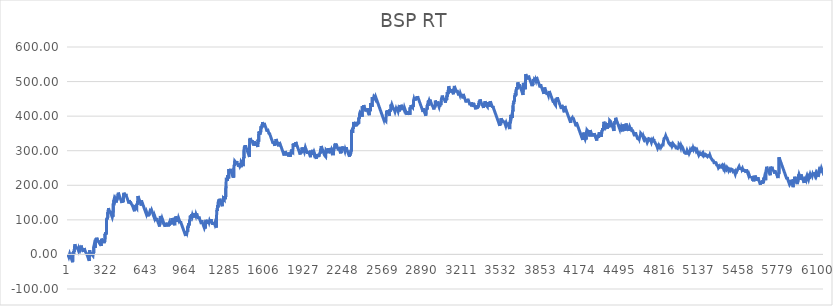
| Category | BSP RT |
|---|---|
| 0 | -1 |
| 1 | -2 |
| 2 | -3 |
| 3 | -4 |
| 4 | -5 |
| 5 | -6 |
| 6 | -7 |
| 7 | -8 |
| 8 | -4.51 |
| 9 | -5.51 |
| 10 | -6.51 |
| 11 | -7.51 |
| 12 | -8.51 |
| 13 | 1.933 |
| 14 | 0.877 |
| 15 | -0.18 |
| 16 | -1.18 |
| 17 | -2.18 |
| 18 | -3.18 |
| 19 | -4.18 |
| 20 | -5.18 |
| 21 | -6.18 |
| 22 | -7.18 |
| 23 | -8.18 |
| 24 | -9.18 |
| 25 | -10.18 |
| 26 | -11.18 |
| 27 | -12.18 |
| 28 | -13.18 |
| 29 | -14.18 |
| 30 | -15.18 |
| 31 | -16.18 |
| 32 | -17.18 |
| 33 | -18.18 |
| 34 | -19.18 |
| 35 | -20.18 |
| 36 | -21.288 |
| 37 | -22.396 |
| 38 | -23.504 |
| 39 | -24.612 |
| 40 | 6.1 |
| 41 | 5.1 |
| 42 | 4.1 |
| 43 | 3.1 |
| 44 | 2.1 |
| 45 | 1.1 |
| 46 | 0.065 |
| 47 | 10.03 |
| 48 | 8.995 |
| 49 | 7.96 |
| 50 | 6.907 |
| 51 | 5.855 |
| 52 | 19.502 |
| 53 | 18.45 |
| 54 | 17.418 |
| 55 | 29.386 |
| 56 | 28.354 |
| 57 | 27.322 |
| 58 | 26.29 |
| 59 | 25.29 |
| 60 | 24.29 |
| 61 | 23.29 |
| 62 | 22.29 |
| 63 | 21.29 |
| 64 | 20.29 |
| 65 | 19.29 |
| 66 | 18.29 |
| 67 | 17.29 |
| 68 | 16.29 |
| 69 | 21.667 |
| 70 | 20.643 |
| 71 | 19.62 |
| 72 | 18.62 |
| 73 | 17.62 |
| 74 | 16.62 |
| 75 | 20.795 |
| 76 | 19.79 |
| 77 | 18.785 |
| 78 | 17.78 |
| 79 | 16.78 |
| 80 | 15.78 |
| 81 | 14.78 |
| 82 | 13.78 |
| 83 | 12.78 |
| 84 | 11.78 |
| 85 | 10.78 |
| 86 | 9.78 |
| 87 | 16.8 |
| 88 | 15.78 |
| 89 | 14.76 |
| 90 | 13.74 |
| 91 | 18.422 |
| 92 | 17.415 |
| 93 | 16.408 |
| 94 | 15.4 |
| 95 | 14.4 |
| 96 | 13.4 |
| 97 | 12.4 |
| 98 | 11.4 |
| 99 | 10.4 |
| 100 | 15.58 |
| 101 | 14.57 |
| 102 | 13.56 |
| 103 | 12.55 |
| 104 | 11.506 |
| 105 | 10.462 |
| 106 | 25.178 |
| 107 | 24.134 |
| 108 | 23.09 |
| 109 | 22.09 |
| 110 | 21.09 |
| 111 | 20.09 |
| 112 | 19.09 |
| 113 | 18.09 |
| 114 | 17.09 |
| 115 | 16.09 |
| 116 | 15.09 |
| 117 | 14.09 |
| 118 | 13.09 |
| 119 | 12.09 |
| 120 | 11.09 |
| 121 | 10.09 |
| 122 | 9.09 |
| 123 | 8.09 |
| 124 | 7.09 |
| 125 | 13.68 |
| 126 | 12.67 |
| 127 | 11.66 |
| 128 | 10.65 |
| 129 | 9.64 |
| 130 | 8.618 |
| 131 | 18.096 |
| 132 | 17.074 |
| 133 | 16.052 |
| 134 | 15.03 |
| 135 | 14.03 |
| 136 | 13.03 |
| 137 | 12.03 |
| 138 | 11.03 |
| 139 | 10.03 |
| 140 | 9.03 |
| 141 | 8.03 |
| 142 | 7.03 |
| 143 | 6.03 |
| 144 | 5.03 |
| 145 | 8.42 |
| 146 | 7.41 |
| 147 | 6.4 |
| 148 | 5.4 |
| 149 | 4.4 |
| 150 | 3.4 |
| 151 | 2.4 |
| 152 | 1.4 |
| 153 | 0.4 |
| 154 | -0.6 |
| 155 | -1.6 |
| 156 | -2.6 |
| 157 | -3.6 |
| 158 | -4.6 |
| 159 | -5.6 |
| 160 | -6.6 |
| 161 | -7.6 |
| 162 | -8.6 |
| 163 | -9.6 |
| 164 | -10.6 |
| 165 | -11.6 |
| 166 | -12.6 |
| 167 | -13.6 |
| 168 | -14.6 |
| 169 | -15.6 |
| 170 | -16.6 |
| 171 | -17.6 |
| 172 | -18.75 |
| 173 | -19.9 |
| 174 | -21.05 |
| 175 | 11.8 |
| 176 | 10.8 |
| 177 | 9.8 |
| 178 | 8.8 |
| 179 | 7.8 |
| 180 | 6.8 |
| 181 | 5.8 |
| 182 | 4.8 |
| 183 | 3.8 |
| 184 | 2.8 |
| 185 | 1.8 |
| 186 | 0.8 |
| 187 | -0.2 |
| 188 | 5.314 |
| 189 | 4.308 |
| 190 | 3.302 |
| 191 | 2.296 |
| 192 | 1.29 |
| 193 | 0.29 |
| 194 | -0.71 |
| 195 | -1.71 |
| 196 | -2.71 |
| 197 | 0.89 |
| 198 | -0.11 |
| 199 | -1.11 |
| 200 | -2.11 |
| 201 | -3.11 |
| 202 | -4.11 |
| 203 | -5.11 |
| 204 | 2.483 |
| 205 | 1.447 |
| 206 | 0.41 |
| 207 | -0.71 |
| 208 | -1.83 |
| 209 | -2.95 |
| 210 | 24.17 |
| 211 | 23.162 |
| 212 | 27.655 |
| 213 | 26.648 |
| 214 | 25.64 |
| 215 | 24.64 |
| 216 | 23.64 |
| 217 | 22.64 |
| 218 | 21.64 |
| 219 | 20.64 |
| 220 | 19.64 |
| 221 | 18.555 |
| 222 | 27.73 |
| 223 | 26.682 |
| 224 | 42.784 |
| 225 | 41.736 |
| 226 | 40.688 |
| 227 | 39.64 |
| 228 | 46.584 |
| 229 | 45.568 |
| 230 | 44.552 |
| 231 | 43.536 |
| 232 | 42.524 |
| 233 | 48.111 |
| 234 | 47.098 |
| 235 | 46.086 |
| 236 | 45.086 |
| 237 | 44.086 |
| 238 | 43.086 |
| 239 | 42.086 |
| 240 | 41.086 |
| 241 | 40.086 |
| 242 | 39.086 |
| 243 | 38.086 |
| 244 | 40.821 |
| 245 | 39.806 |
| 246 | 38.806 |
| 247 | 37.806 |
| 248 | 36.806 |
| 249 | 35.806 |
| 250 | 39.816 |
| 251 | 38.816 |
| 252 | 37.816 |
| 253 | 36.816 |
| 254 | 35.816 |
| 255 | 34.816 |
| 256 | 33.816 |
| 257 | 32.816 |
| 258 | 31.816 |
| 259 | 30.816 |
| 260 | 29.816 |
| 261 | 33.643 |
| 262 | 32.629 |
| 263 | 31.616 |
| 264 | 30.616 |
| 265 | 29.616 |
| 266 | 28.616 |
| 267 | 27.616 |
| 268 | 26.616 |
| 269 | 25.526 |
| 270 | 24.436 |
| 271 | 45.356 |
| 272 | 44.266 |
| 273 | 43.266 |
| 274 | 42.266 |
| 275 | 41.266 |
| 276 | 40.266 |
| 277 | 39.266 |
| 278 | 38.266 |
| 279 | 37.266 |
| 280 | 36.266 |
| 281 | 35.266 |
| 282 | 34.266 |
| 283 | 33.248 |
| 284 | 41.63 |
| 285 | 40.612 |
| 286 | 39.594 |
| 287 | 38.576 |
| 288 | 37.576 |
| 289 | 36.576 |
| 290 | 35.576 |
| 291 | 34.576 |
| 292 | 33.576 |
| 293 | 32.558 |
| 294 | 31.54 |
| 295 | 39.922 |
| 296 | 38.904 |
| 297 | 37.886 |
| 298 | 36.802 |
| 299 | 35.718 |
| 300 | 34.634 |
| 301 | 59.55 |
| 302 | 58.466 |
| 303 | 57.466 |
| 304 | 56.466 |
| 305 | 64.002 |
| 306 | 62.988 |
| 307 | 61.974 |
| 308 | 60.96 |
| 309 | 59.946 |
| 310 | 58.686 |
| 311 | 57.426 |
| 312 | 98.166 |
| 313 | 103.56 |
| 314 | 102.554 |
| 315 | 101.548 |
| 316 | 100.542 |
| 317 | 99.536 |
| 318 | 106.296 |
| 319 | 105.276 |
| 320 | 104.256 |
| 321 | 103.236 |
| 322 | 102.116 |
| 323 | 121.946 |
| 324 | 120.826 |
| 325 | 119.761 |
| 326 | 118.696 |
| 327 | 117.631 |
| 328 | 133.566 |
| 329 | 132.566 |
| 330 | 131.566 |
| 331 | 130.566 |
| 332 | 129.566 |
| 333 | 128.566 |
| 334 | 127.566 |
| 335 | 126.566 |
| 336 | 125.566 |
| 337 | 124.566 |
| 338 | 123.566 |
| 339 | 122.566 |
| 340 | 121.566 |
| 341 | 125.453 |
| 342 | 124.439 |
| 343 | 123.426 |
| 344 | 122.426 |
| 345 | 121.426 |
| 346 | 120.426 |
| 347 | 119.426 |
| 348 | 118.426 |
| 349 | 117.426 |
| 350 | 116.426 |
| 351 | 115.426 |
| 352 | 114.426 |
| 353 | 113.426 |
| 354 | 112.426 |
| 355 | 111.426 |
| 356 | 110.426 |
| 357 | 109.426 |
| 358 | 108.426 |
| 359 | 107.426 |
| 360 | 106.426 |
| 361 | 105.426 |
| 362 | 112.193 |
| 363 | 111.159 |
| 364 | 110.126 |
| 365 | 108.936 |
| 366 | 107.746 |
| 367 | 106.556 |
| 368 | 147.366 |
| 369 | 146.332 |
| 370 | 145.298 |
| 371 | 144.264 |
| 372 | 156.67 |
| 373 | 155.636 |
| 374 | 154.626 |
| 375 | 161.146 |
| 376 | 160.136 |
| 377 | 159.126 |
| 378 | 158.116 |
| 379 | 157.116 |
| 380 | 156.116 |
| 381 | 155.116 |
| 382 | 154.116 |
| 383 | 153.106 |
| 384 | 159.496 |
| 385 | 158.486 |
| 386 | 157.476 |
| 387 | 156.466 |
| 388 | 155.466 |
| 389 | 154.466 |
| 390 | 153.466 |
| 391 | 152.466 |
| 392 | 151.466 |
| 393 | 150.386 |
| 394 | 159.306 |
| 395 | 158.306 |
| 396 | 157.306 |
| 397 | 156.306 |
| 398 | 155.306 |
| 399 | 154.278 |
| 400 | 165.25 |
| 401 | 164.222 |
| 402 | 163.194 |
| 403 | 162.166 |
| 404 | 161.108 |
| 405 | 160.051 |
| 406 | 174.624 |
| 407 | 173.566 |
| 408 | 178.656 |
| 409 | 177.636 |
| 410 | 176.616 |
| 411 | 175.616 |
| 412 | 174.616 |
| 413 | 173.616 |
| 414 | 172.616 |
| 415 | 171.616 |
| 416 | 170.616 |
| 417 | 169.616 |
| 418 | 168.616 |
| 419 | 167.616 |
| 420 | 166.616 |
| 421 | 165.616 |
| 422 | 164.616 |
| 423 | 163.616 |
| 424 | 162.616 |
| 425 | 161.616 |
| 426 | 160.616 |
| 427 | 159.616 |
| 428 | 158.616 |
| 429 | 157.616 |
| 430 | 156.616 |
| 431 | 155.616 |
| 432 | 154.616 |
| 433 | 153.616 |
| 434 | 152.616 |
| 435 | 151.616 |
| 436 | 150.616 |
| 437 | 149.616 |
| 438 | 148.616 |
| 439 | 160.594 |
| 440 | 159.562 |
| 441 | 158.53 |
| 442 | 157.498 |
| 443 | 156.466 |
| 444 | 155.466 |
| 445 | 154.466 |
| 446 | 153.466 |
| 447 | 152.378 |
| 448 | 151.29 |
| 449 | 150.202 |
| 450 | 149.114 |
| 451 | 175.026 |
| 452 | 174.026 |
| 453 | 173.026 |
| 454 | 172.026 |
| 455 | 178.211 |
| 456 | 177.196 |
| 457 | 176.181 |
| 458 | 175.166 |
| 459 | 174.166 |
| 460 | 173.166 |
| 461 | 172.166 |
| 462 | 171.166 |
| 463 | 170.166 |
| 464 | 169.166 |
| 465 | 168.166 |
| 466 | 167.166 |
| 467 | 166.091 |
| 468 | 174.616 |
| 469 | 173.616 |
| 470 | 172.616 |
| 471 | 171.616 |
| 472 | 170.616 |
| 473 | 169.616 |
| 474 | 168.616 |
| 475 | 167.616 |
| 476 | 166.616 |
| 477 | 165.616 |
| 478 | 164.616 |
| 479 | 163.616 |
| 480 | 162.616 |
| 481 | 161.616 |
| 482 | 160.616 |
| 483 | 159.616 |
| 484 | 158.616 |
| 485 | 157.616 |
| 486 | 156.616 |
| 487 | 155.616 |
| 488 | 154.616 |
| 489 | 153.616 |
| 490 | 152.616 |
| 491 | 151.616 |
| 492 | 150.616 |
| 493 | 149.616 |
| 494 | 148.616 |
| 495 | 147.616 |
| 496 | 146.592 |
| 497 | 156.568 |
| 498 | 155.544 |
| 499 | 154.52 |
| 500 | 153.496 |
| 501 | 152.496 |
| 502 | 151.496 |
| 503 | 150.496 |
| 504 | 149.496 |
| 505 | 148.496 |
| 506 | 147.496 |
| 507 | 152.286 |
| 508 | 151.276 |
| 509 | 150.266 |
| 510 | 149.256 |
| 511 | 148.256 |
| 512 | 147.256 |
| 513 | 146.256 |
| 514 | 145.254 |
| 515 | 148.941 |
| 516 | 147.938 |
| 517 | 146.936 |
| 518 | 145.936 |
| 519 | 144.936 |
| 520 | 143.936 |
| 521 | 142.936 |
| 522 | 141.936 |
| 523 | 140.936 |
| 524 | 139.936 |
| 525 | 138.936 |
| 526 | 137.936 |
| 527 | 136.936 |
| 528 | 135.936 |
| 529 | 134.936 |
| 530 | 133.936 |
| 531 | 132.936 |
| 532 | 131.936 |
| 533 | 130.936 |
| 534 | 129.936 |
| 535 | 128.936 |
| 536 | 127.936 |
| 537 | 126.936 |
| 538 | 125.936 |
| 539 | 124.904 |
| 540 | 123.871 |
| 541 | 133.338 |
| 542 | 132.306 |
| 543 | 131.239 |
| 544 | 143.173 |
| 545 | 142.106 |
| 546 | 141.106 |
| 547 | 140.106 |
| 548 | 139.106 |
| 549 | 138.106 |
| 550 | 137.106 |
| 551 | 136.106 |
| 552 | 139.406 |
| 553 | 138.406 |
| 554 | 137.406 |
| 555 | 136.406 |
| 556 | 135.406 |
| 557 | 134.368 |
| 558 | 133.33 |
| 559 | 146.592 |
| 560 | 145.554 |
| 561 | 144.516 |
| 562 | 143.484 |
| 563 | 142.452 |
| 564 | 154.27 |
| 565 | 153.238 |
| 566 | 152.206 |
| 567 | 151.15 |
| 568 | 168.854 |
| 569 | 167.798 |
| 570 | 166.742 |
| 571 | 165.686 |
| 572 | 164.686 |
| 573 | 163.686 |
| 574 | 162.686 |
| 575 | 161.686 |
| 576 | 160.686 |
| 577 | 159.686 |
| 578 | 158.686 |
| 579 | 157.686 |
| 580 | 156.686 |
| 581 | 155.686 |
| 582 | 154.686 |
| 583 | 153.686 |
| 584 | 152.686 |
| 585 | 151.686 |
| 586 | 150.686 |
| 587 | 149.686 |
| 588 | 148.686 |
| 589 | 147.686 |
| 590 | 146.686 |
| 591 | 145.686 |
| 592 | 144.686 |
| 593 | 143.686 |
| 594 | 142.628 |
| 595 | 141.571 |
| 596 | 156.114 |
| 597 | 155.056 |
| 598 | 154.056 |
| 599 | 153.056 |
| 600 | 152.056 |
| 601 | 151.056 |
| 602 | 150.056 |
| 603 | 149.056 |
| 604 | 148.056 |
| 605 | 147.056 |
| 606 | 146.056 |
| 607 | 145.056 |
| 608 | 144.056 |
| 609 | 143.056 |
| 610 | 142.056 |
| 611 | 141.056 |
| 612 | 140.056 |
| 613 | 139.056 |
| 614 | 138.056 |
| 615 | 137.056 |
| 616 | 136.056 |
| 617 | 135.056 |
| 618 | 134.056 |
| 619 | 133.056 |
| 620 | 132.056 |
| 621 | 131.056 |
| 622 | 130.056 |
| 623 | 129.056 |
| 624 | 128.056 |
| 625 | 127.056 |
| 626 | 126.056 |
| 627 | 125.056 |
| 628 | 124.056 |
| 629 | 123.056 |
| 630 | 122.056 |
| 631 | 121.056 |
| 632 | 120.056 |
| 633 | 119.056 |
| 634 | 118.056 |
| 635 | 117.056 |
| 636 | 116.056 |
| 637 | 115.036 |
| 638 | 122.216 |
| 639 | 121.196 |
| 640 | 120.176 |
| 641 | 119.176 |
| 642 | 118.176 |
| 643 | 117.176 |
| 644 | 116.176 |
| 645 | 115.176 |
| 646 | 114.176 |
| 647 | 113.176 |
| 648 | 112.176 |
| 649 | 111.176 |
| 650 | 110.141 |
| 651 | 109.106 |
| 652 | 119.091 |
| 653 | 118.056 |
| 654 | 117.056 |
| 655 | 116.056 |
| 656 | 115.056 |
| 657 | 114.056 |
| 658 | 113.056 |
| 659 | 112.036 |
| 660 | 111.016 |
| 661 | 119.996 |
| 662 | 118.976 |
| 663 | 117.956 |
| 664 | 120.716 |
| 665 | 119.696 |
| 666 | 118.668 |
| 667 | 126.911 |
| 668 | 125.884 |
| 669 | 124.856 |
| 670 | 129.726 |
| 671 | 128.716 |
| 672 | 127.706 |
| 673 | 126.696 |
| 674 | 125.696 |
| 675 | 124.696 |
| 676 | 123.696 |
| 677 | 122.696 |
| 678 | 121.696 |
| 679 | 127.284 |
| 680 | 126.271 |
| 681 | 125.258 |
| 682 | 124.246 |
| 683 | 123.246 |
| 684 | 122.246 |
| 685 | 121.246 |
| 686 | 120.246 |
| 687 | 119.246 |
| 688 | 118.246 |
| 689 | 117.246 |
| 690 | 116.246 |
| 691 | 115.246 |
| 692 | 114.246 |
| 693 | 113.246 |
| 694 | 112.246 |
| 695 | 111.246 |
| 696 | 110.246 |
| 697 | 109.246 |
| 698 | 108.246 |
| 699 | 107.246 |
| 700 | 106.246 |
| 701 | 105.246 |
| 702 | 104.209 |
| 703 | 111.773 |
| 704 | 110.736 |
| 705 | 109.736 |
| 706 | 108.736 |
| 707 | 107.736 |
| 708 | 106.736 |
| 709 | 105.736 |
| 710 | 104.736 |
| 711 | 103.736 |
| 712 | 102.736 |
| 713 | 101.736 |
| 714 | 100.736 |
| 715 | 99.736 |
| 716 | 98.736 |
| 717 | 97.72 |
| 718 | 96.704 |
| 719 | 104.918 |
| 720 | 103.902 |
| 721 | 102.886 |
| 722 | 101.886 |
| 723 | 100.886 |
| 724 | 99.886 |
| 725 | 98.886 |
| 726 | 97.886 |
| 727 | 96.886 |
| 728 | 95.886 |
| 729 | 94.886 |
| 730 | 93.886 |
| 731 | 92.886 |
| 732 | 91.886 |
| 733 | 90.886 |
| 734 | 89.886 |
| 735 | 88.886 |
| 736 | 87.886 |
| 737 | 86.886 |
| 738 | 85.886 |
| 739 | 84.886 |
| 740 | 83.886 |
| 741 | 82.886 |
| 742 | 81.886 |
| 743 | 80.886 |
| 744 | 79.886 |
| 745 | 78.696 |
| 746 | 98.506 |
| 747 | 97.419 |
| 748 | 96.333 |
| 749 | 111.246 |
| 750 | 110.246 |
| 751 | 109.246 |
| 752 | 108.246 |
| 753 | 107.246 |
| 754 | 106.246 |
| 755 | 105.246 |
| 756 | 104.246 |
| 757 | 103.246 |
| 758 | 102.246 |
| 759 | 101.246 |
| 760 | 100.246 |
| 761 | 99.246 |
| 762 | 98.246 |
| 763 | 97.234 |
| 764 | 104.132 |
| 765 | 103.12 |
| 766 | 102.108 |
| 767 | 101.096 |
| 768 | 100.096 |
| 769 | 99.096 |
| 770 | 98.096 |
| 771 | 97.096 |
| 772 | 96.096 |
| 773 | 95.096 |
| 774 | 94.096 |
| 775 | 93.096 |
| 776 | 92.096 |
| 777 | 91.096 |
| 778 | 90.096 |
| 779 | 89.096 |
| 780 | 88.096 |
| 781 | 87.096 |
| 782 | 86.096 |
| 783 | 85.096 |
| 784 | 84.096 |
| 785 | 83.096 |
| 786 | 82.096 |
| 787 | 81.096 |
| 788 | 80.096 |
| 789 | 79.096 |
| 790 | 85.556 |
| 791 | 84.546 |
| 792 | 83.536 |
| 793 | 82.526 |
| 794 | 81.516 |
| 795 | 80.488 |
| 796 | 91.46 |
| 797 | 90.432 |
| 798 | 89.404 |
| 799 | 88.376 |
| 800 | 87.376 |
| 801 | 86.376 |
| 802 | 85.376 |
| 803 | 84.376 |
| 804 | 83.376 |
| 805 | 82.356 |
| 806 | 81.336 |
| 807 | 90.156 |
| 808 | 89.136 |
| 809 | 88.116 |
| 810 | 87.116 |
| 811 | 86.116 |
| 812 | 85.116 |
| 813 | 84.116 |
| 814 | 83.116 |
| 815 | 82.116 |
| 816 | 81.116 |
| 817 | 85.614 |
| 818 | 84.612 |
| 819 | 83.61 |
| 820 | 82.608 |
| 821 | 81.606 |
| 822 | 89.983 |
| 823 | 88.939 |
| 824 | 87.896 |
| 825 | 93.316 |
| 826 | 92.306 |
| 827 | 91.296 |
| 828 | 90.286 |
| 829 | 95.74 |
| 830 | 94.734 |
| 831 | 93.728 |
| 832 | 92.722 |
| 833 | 91.716 |
| 834 | 90.716 |
| 835 | 89.716 |
| 836 | 88.716 |
| 837 | 87.716 |
| 838 | 86.682 |
| 839 | 85.648 |
| 840 | 84.614 |
| 841 | 97.06 |
| 842 | 96.026 |
| 843 | 94.996 |
| 844 | 93.966 |
| 845 | 105.436 |
| 846 | 104.406 |
| 847 | 103.376 |
| 848 | 102.376 |
| 849 | 101.376 |
| 850 | 100.376 |
| 851 | 99.376 |
| 852 | 98.376 |
| 853 | 97.376 |
| 854 | 96.376 |
| 855 | 95.376 |
| 856 | 94.376 |
| 857 | 93.376 |
| 858 | 92.376 |
| 859 | 91.376 |
| 860 | 90.376 |
| 861 | 89.376 |
| 862 | 88.376 |
| 863 | 87.376 |
| 864 | 86.326 |
| 865 | 85.276 |
| 866 | 84.226 |
| 867 | 83.176 |
| 868 | 99.776 |
| 869 | 98.756 |
| 870 | 105.536 |
| 871 | 104.516 |
| 872 | 103.496 |
| 873 | 102.482 |
| 874 | 109.848 |
| 875 | 108.834 |
| 876 | 107.82 |
| 877 | 106.806 |
| 878 | 105.806 |
| 879 | 104.806 |
| 880 | 103.806 |
| 881 | 102.806 |
| 882 | 101.806 |
| 883 | 100.806 |
| 884 | 99.806 |
| 885 | 98.806 |
| 886 | 97.806 |
| 887 | 96.806 |
| 888 | 95.806 |
| 889 | 94.806 |
| 890 | 93.806 |
| 891 | 92.806 |
| 892 | 105.272 |
| 893 | 104.238 |
| 894 | 103.204 |
| 895 | 102.17 |
| 896 | 101.136 |
| 897 | 105.528 |
| 898 | 104.521 |
| 899 | 103.514 |
| 900 | 102.506 |
| 901 | 101.506 |
| 902 | 100.506 |
| 903 | 99.506 |
| 904 | 98.506 |
| 905 | 97.506 |
| 906 | 96.506 |
| 907 | 95.506 |
| 908 | 94.506 |
| 909 | 93.506 |
| 910 | 92.506 |
| 911 | 91.506 |
| 912 | 90.506 |
| 913 | 95.536 |
| 914 | 94.526 |
| 915 | 93.516 |
| 916 | 92.506 |
| 917 | 91.506 |
| 918 | 90.506 |
| 919 | 89.506 |
| 920 | 88.506 |
| 921 | 87.506 |
| 922 | 86.506 |
| 923 | 85.506 |
| 924 | 84.506 |
| 925 | 83.506 |
| 926 | 82.506 |
| 927 | 81.506 |
| 928 | 80.506 |
| 929 | 79.506 |
| 930 | 78.506 |
| 931 | 77.506 |
| 932 | 76.506 |
| 933 | 75.506 |
| 934 | 74.506 |
| 935 | 73.506 |
| 936 | 72.506 |
| 937 | 71.506 |
| 938 | 70.506 |
| 939 | 69.506 |
| 940 | 68.506 |
| 941 | 67.506 |
| 942 | 66.506 |
| 943 | 65.506 |
| 944 | 64.506 |
| 945 | 63.506 |
| 946 | 62.506 |
| 947 | 61.506 |
| 948 | 60.506 |
| 949 | 59.506 |
| 950 | 58.506 |
| 951 | 57.506 |
| 952 | 56.506 |
| 953 | 55.506 |
| 954 | 54.506 |
| 955 | 53.46 |
| 956 | 67.914 |
| 957 | 66.868 |
| 958 | 65.822 |
| 959 | 64.822 |
| 960 | 63.822 |
| 961 | 62.822 |
| 962 | 61.822 |
| 963 | 66.28 |
| 964 | 65.278 |
| 965 | 64.276 |
| 966 | 63.274 |
| 967 | 62.272 |
| 968 | 61.258 |
| 969 | 68.724 |
| 970 | 67.71 |
| 971 | 66.696 |
| 972 | 65.682 |
| 973 | 80.795 |
| 974 | 79.709 |
| 975 | 78.622 |
| 976 | 77.572 |
| 977 | 83.742 |
| 978 | 89.757 |
| 979 | 88.742 |
| 980 | 87.727 |
| 981 | 86.712 |
| 982 | 85.676 |
| 983 | 84.64 |
| 984 | 83.604 |
| 985 | 82.568 |
| 986 | 95.312 |
| 987 | 99.032 |
| 988 | 98.032 |
| 989 | 97.032 |
| 990 | 96.032 |
| 991 | 95.032 |
| 992 | 93.97 |
| 993 | 111.578 |
| 994 | 110.516 |
| 995 | 109.516 |
| 996 | 108.516 |
| 997 | 107.516 |
| 998 | 112.366 |
| 999 | 111.356 |
| 1000 | 110.346 |
| 1001 | 109.336 |
| 1002 | 116.324 |
| 1003 | 115.312 |
| 1004 | 114.3 |
| 1005 | 113.288 |
| 1006 | 112.276 |
| 1007 | 111.276 |
| 1008 | 110.276 |
| 1009 | 109.276 |
| 1010 | 113.694 |
| 1011 | 112.692 |
| 1012 | 111.69 |
| 1013 | 110.688 |
| 1014 | 109.686 |
| 1015 | 108.662 |
| 1016 | 118.638 |
| 1017 | 117.614 |
| 1018 | 116.59 |
| 1019 | 115.566 |
| 1020 | 114.566 |
| 1021 | 113.566 |
| 1022 | 112.566 |
| 1023 | 111.566 |
| 1024 | 110.566 |
| 1025 | 109.566 |
| 1026 | 108.566 |
| 1027 | 107.566 |
| 1028 | 106.566 |
| 1029 | 105.526 |
| 1030 | 104.486 |
| 1031 | 118.406 |
| 1032 | 117.366 |
| 1033 | 116.326 |
| 1034 | 115.326 |
| 1035 | 114.326 |
| 1036 | 113.326 |
| 1037 | 112.326 |
| 1038 | 111.326 |
| 1039 | 115.864 |
| 1040 | 114.862 |
| 1041 | 113.86 |
| 1042 | 112.858 |
| 1043 | 111.856 |
| 1044 | 118.146 |
| 1045 | 117.136 |
| 1046 | 116.126 |
| 1047 | 115.116 |
| 1048 | 114.106 |
| 1049 | 113.106 |
| 1050 | 112.106 |
| 1051 | 111.106 |
| 1052 | 110.106 |
| 1053 | 109.106 |
| 1054 | 108.106 |
| 1055 | 107.106 |
| 1056 | 106.106 |
| 1057 | 105.106 |
| 1058 | 104.106 |
| 1059 | 103.106 |
| 1060 | 102.106 |
| 1061 | 101.09 |
| 1062 | 108.954 |
| 1063 | 107.938 |
| 1064 | 106.922 |
| 1065 | 105.906 |
| 1066 | 104.906 |
| 1067 | 103.906 |
| 1068 | 102.906 |
| 1069 | 101.906 |
| 1070 | 100.906 |
| 1071 | 99.906 |
| 1072 | 98.906 |
| 1073 | 97.906 |
| 1074 | 96.906 |
| 1075 | 95.906 |
| 1076 | 94.906 |
| 1077 | 93.906 |
| 1078 | 92.906 |
| 1079 | 91.906 |
| 1080 | 90.906 |
| 1081 | 89.906 |
| 1082 | 88.906 |
| 1083 | 87.906 |
| 1084 | 86.906 |
| 1085 | 98.256 |
| 1086 | 97.226 |
| 1087 | 96.196 |
| 1088 | 95.166 |
| 1089 | 94.136 |
| 1090 | 93.136 |
| 1091 | 92.136 |
| 1092 | 91.136 |
| 1093 | 90.136 |
| 1094 | 89.136 |
| 1095 | 88.136 |
| 1096 | 87.136 |
| 1097 | 86.136 |
| 1098 | 85.136 |
| 1099 | 84.136 |
| 1100 | 83.136 |
| 1101 | 82.136 |
| 1102 | 81.136 |
| 1103 | 80.136 |
| 1104 | 79.136 |
| 1105 | 78.136 |
| 1106 | 77.136 |
| 1107 | 76.136 |
| 1108 | 75.136 |
| 1109 | 80.921 |
| 1110 | 79.906 |
| 1111 | 78.891 |
| 1112 | 77.876 |
| 1113 | 76.876 |
| 1114 | 75.876 |
| 1115 | 74.796 |
| 1116 | 93.956 |
| 1117 | 92.876 |
| 1118 | 91.796 |
| 1119 | 100.153 |
| 1120 | 99.109 |
| 1121 | 98.066 |
| 1122 | 97.066 |
| 1123 | 96.066 |
| 1124 | 95.066 |
| 1125 | 94.066 |
| 1126 | 93.066 |
| 1127 | 92.066 |
| 1128 | 91.066 |
| 1129 | 97.458 |
| 1130 | 96.441 |
| 1131 | 95.423 |
| 1132 | 94.406 |
| 1133 | 93.406 |
| 1134 | 92.406 |
| 1135 | 91.406 |
| 1136 | 90.406 |
| 1137 | 89.406 |
| 1138 | 88.378 |
| 1139 | 98.4 |
| 1140 | 97.372 |
| 1141 | 96.344 |
| 1142 | 95.344 |
| 1143 | 94.344 |
| 1144 | 93.344 |
| 1145 | 92.344 |
| 1146 | 91.344 |
| 1147 | 90.317 |
| 1148 | 96.491 |
| 1149 | 95.464 |
| 1150 | 94.464 |
| 1151 | 93.464 |
| 1152 | 92.464 |
| 1153 | 91.464 |
| 1154 | 90.464 |
| 1155 | 89.444 |
| 1156 | 98.444 |
| 1157 | 97.424 |
| 1158 | 96.404 |
| 1159 | 95.384 |
| 1160 | 101.334 |
| 1161 | 100.284 |
| 1162 | 99.284 |
| 1163 | 98.284 |
| 1164 | 97.284 |
| 1165 | 96.284 |
| 1166 | 95.284 |
| 1167 | 94.284 |
| 1168 | 93.284 |
| 1169 | 92.284 |
| 1170 | 91.284 |
| 1171 | 90.284 |
| 1172 | 89.284 |
| 1173 | 88.284 |
| 1174 | 87.284 |
| 1175 | 86.284 |
| 1176 | 85.284 |
| 1177 | 84.268 |
| 1178 | 92.392 |
| 1179 | 91.376 |
| 1180 | 90.36 |
| 1181 | 89.344 |
| 1182 | 88.344 |
| 1183 | 87.344 |
| 1184 | 86.344 |
| 1185 | 93.222 |
| 1186 | 92.21 |
| 1187 | 91.198 |
| 1188 | 90.186 |
| 1189 | 89.174 |
| 1190 | 88.174 |
| 1191 | 87.174 |
| 1192 | 86.174 |
| 1193 | 90.089 |
| 1194 | 89.084 |
| 1195 | 88.079 |
| 1196 | 87.074 |
| 1197 | 86.074 |
| 1198 | 85.074 |
| 1199 | 84.074 |
| 1200 | 83.074 |
| 1201 | 82.074 |
| 1202 | 80.95 |
| 1203 | 79.826 |
| 1204 | 78.702 |
| 1205 | 77.578 |
| 1206 | 112.404 |
| 1207 | 111.346 |
| 1208 | 110.288 |
| 1209 | 128.62 |
| 1210 | 127.562 |
| 1211 | 126.504 |
| 1212 | 125.434 |
| 1213 | 142.364 |
| 1214 | 141.294 |
| 1215 | 140.224 |
| 1216 | 139.18 |
| 1217 | 138.136 |
| 1218 | 137.092 |
| 1219 | 136.048 |
| 1220 | 151.004 |
| 1221 | 149.998 |
| 1222 | 155.682 |
| 1223 | 154.676 |
| 1224 | 153.67 |
| 1225 | 152.664 |
| 1226 | 159.094 |
| 1227 | 158.084 |
| 1228 | 157.074 |
| 1229 | 156.064 |
| 1230 | 155.054 |
| 1231 | 160.846 |
| 1232 | 159.838 |
| 1233 | 158.83 |
| 1234 | 157.822 |
| 1235 | 156.814 |
| 1236 | 155.814 |
| 1237 | 154.814 |
| 1238 | 153.814 |
| 1239 | 152.814 |
| 1240 | 151.814 |
| 1241 | 150.814 |
| 1242 | 149.814 |
| 1243 | 148.814 |
| 1244 | 147.814 |
| 1245 | 146.814 |
| 1246 | 145.814 |
| 1247 | 144.814 |
| 1248 | 143.814 |
| 1249 | 142.756 |
| 1250 | 141.698 |
| 1251 | 140.64 |
| 1252 | 139.582 |
| 1253 | 157.814 |
| 1254 | 156.814 |
| 1255 | 155.814 |
| 1256 | 154.814 |
| 1257 | 153.814 |
| 1258 | 152.814 |
| 1259 | 151.786 |
| 1260 | 150.758 |
| 1261 | 161.65 |
| 1262 | 160.622 |
| 1263 | 159.594 |
| 1264 | 163.314 |
| 1265 | 162.314 |
| 1266 | 161.314 |
| 1267 | 160.314 |
| 1268 | 159.314 |
| 1269 | 158.286 |
| 1270 | 169.128 |
| 1271 | 168.1 |
| 1272 | 167.072 |
| 1273 | 166.044 |
| 1274 | 165.044 |
| 1275 | 164.044 |
| 1276 | 163.044 |
| 1277 | 162.044 |
| 1278 | 161.044 |
| 1279 | 159.859 |
| 1280 | 158.674 |
| 1281 | 157.489 |
| 1282 | 197.184 |
| 1283 | 196.064 |
| 1284 | 194.944 |
| 1285 | 222.034 |
| 1286 | 220.914 |
| 1287 | 219.914 |
| 1288 | 218.914 |
| 1289 | 217.914 |
| 1290 | 216.914 |
| 1291 | 215.914 |
| 1292 | 214.866 |
| 1293 | 213.818 |
| 1294 | 212.77 |
| 1295 | 228.872 |
| 1296 | 227.824 |
| 1297 | 226.824 |
| 1298 | 225.824 |
| 1299 | 224.824 |
| 1300 | 223.824 |
| 1301 | 222.824 |
| 1302 | 221.724 |
| 1303 | 220.624 |
| 1304 | 219.524 |
| 1305 | 218.424 |
| 1306 | 247.324 |
| 1307 | 246.324 |
| 1308 | 245.324 |
| 1309 | 244.324 |
| 1310 | 243.324 |
| 1311 | 242.324 |
| 1312 | 241.324 |
| 1313 | 240.324 |
| 1314 | 239.324 |
| 1315 | 238.292 |
| 1316 | 237.259 |
| 1317 | 246.686 |
| 1318 | 245.654 |
| 1319 | 244.654 |
| 1320 | 243.654 |
| 1321 | 242.654 |
| 1322 | 241.654 |
| 1323 | 240.654 |
| 1324 | 239.654 |
| 1325 | 238.654 |
| 1326 | 237.654 |
| 1327 | 236.654 |
| 1328 | 235.654 |
| 1329 | 234.654 |
| 1330 | 233.654 |
| 1331 | 232.654 |
| 1332 | 231.654 |
| 1333 | 230.654 |
| 1334 | 229.654 |
| 1335 | 228.654 |
| 1336 | 227.654 |
| 1337 | 226.654 |
| 1338 | 225.654 |
| 1339 | 224.654 |
| 1340 | 223.654 |
| 1341 | 222.654 |
| 1342 | 226.144 |
| 1343 | 225.134 |
| 1344 | 224.124 |
| 1345 | 222.869 |
| 1346 | 249.354 |
| 1347 | 248.322 |
| 1348 | 247.29 |
| 1349 | 259.388 |
| 1350 | 258.356 |
| 1351 | 257.324 |
| 1352 | 256.264 |
| 1353 | 255.204 |
| 1354 | 270.024 |
| 1355 | 268.964 |
| 1356 | 272.562 |
| 1357 | 271.559 |
| 1358 | 270.556 |
| 1359 | 269.554 |
| 1360 | 268.554 |
| 1361 | 267.554 |
| 1362 | 266.554 |
| 1363 | 265.554 |
| 1364 | 264.554 |
| 1365 | 263.554 |
| 1366 | 262.554 |
| 1367 | 261.554 |
| 1368 | 260.534 |
| 1369 | 269.374 |
| 1370 | 268.354 |
| 1371 | 267.334 |
| 1372 | 266.314 |
| 1373 | 265.314 |
| 1374 | 264.314 |
| 1375 | 263.314 |
| 1376 | 262.314 |
| 1377 | 261.314 |
| 1378 | 260.314 |
| 1379 | 259.314 |
| 1380 | 258.314 |
| 1381 | 257.314 |
| 1382 | 256.314 |
| 1383 | 255.288 |
| 1384 | 254.262 |
| 1385 | 253.236 |
| 1386 | 263.6 |
| 1387 | 262.574 |
| 1388 | 261.574 |
| 1389 | 260.574 |
| 1390 | 259.574 |
| 1391 | 258.574 |
| 1392 | 257.574 |
| 1393 | 256.574 |
| 1394 | 255.574 |
| 1395 | 254.574 |
| 1396 | 253.574 |
| 1397 | 256.221 |
| 1398 | 255.217 |
| 1399 | 254.214 |
| 1400 | 258.314 |
| 1401 | 257.314 |
| 1402 | 256.314 |
| 1403 | 255.314 |
| 1404 | 254.314 |
| 1405 | 253.268 |
| 1406 | 252.222 |
| 1407 | 267.676 |
| 1408 | 266.63 |
| 1409 | 265.584 |
| 1410 | 267.654 |
| 1411 | 266.654 |
| 1412 | 265.654 |
| 1413 | 264.654 |
| 1414 | 263.654 |
| 1415 | 262.654 |
| 1416 | 261.654 |
| 1417 | 260.654 |
| 1418 | 259.654 |
| 1419 | 258.654 |
| 1420 | 257.654 |
| 1421 | 256.556 |
| 1422 | 255.458 |
| 1423 | 254.36 |
| 1424 | 253.262 |
| 1425 | 281.534 |
| 1426 | 280.456 |
| 1427 | 279.378 |
| 1428 | 278.3 |
| 1429 | 301.632 |
| 1430 | 300.554 |
| 1431 | 311.424 |
| 1432 | 310.384 |
| 1433 | 309.344 |
| 1434 | 308.304 |
| 1435 | 307.234 |
| 1436 | 314.964 |
| 1437 | 313.964 |
| 1438 | 312.964 |
| 1439 | 311.964 |
| 1440 | 315.254 |
| 1441 | 314.244 |
| 1442 | 313.234 |
| 1443 | 312.234 |
| 1444 | 311.234 |
| 1445 | 310.234 |
| 1446 | 309.234 |
| 1447 | 308.234 |
| 1448 | 307.234 |
| 1449 | 306.234 |
| 1450 | 305.234 |
| 1451 | 304.234 |
| 1452 | 303.234 |
| 1453 | 302.234 |
| 1454 | 301.234 |
| 1455 | 300.234 |
| 1456 | 299.234 |
| 1457 | 298.234 |
| 1458 | 297.234 |
| 1459 | 296.234 |
| 1460 | 295.234 |
| 1461 | 294.234 |
| 1462 | 293.234 |
| 1463 | 292.234 |
| 1464 | 291.234 |
| 1465 | 290.234 |
| 1466 | 289.234 |
| 1467 | 288.234 |
| 1468 | 287.234 |
| 1469 | 286.234 |
| 1470 | 285.234 |
| 1471 | 284.234 |
| 1472 | 283.234 |
| 1473 | 281.884 |
| 1474 | 280.534 |
| 1475 | 334.744 |
| 1476 | 333.744 |
| 1477 | 332.744 |
| 1478 | 331.744 |
| 1479 | 330.744 |
| 1480 | 336.636 |
| 1481 | 335.628 |
| 1482 | 334.62 |
| 1483 | 333.612 |
| 1484 | 332.604 |
| 1485 | 331.604 |
| 1486 | 330.604 |
| 1487 | 329.604 |
| 1488 | 328.604 |
| 1489 | 327.604 |
| 1490 | 326.604 |
| 1491 | 325.604 |
| 1492 | 324.604 |
| 1493 | 323.604 |
| 1494 | 329.874 |
| 1495 | 328.864 |
| 1496 | 327.854 |
| 1497 | 326.844 |
| 1498 | 325.834 |
| 1499 | 324.834 |
| 1500 | 323.834 |
| 1501 | 322.834 |
| 1502 | 321.834 |
| 1503 | 320.834 |
| 1504 | 319.834 |
| 1505 | 318.834 |
| 1506 | 317.834 |
| 1507 | 316.834 |
| 1508 | 315.834 |
| 1509 | 314.834 |
| 1510 | 313.792 |
| 1511 | 312.75 |
| 1512 | 327.208 |
| 1513 | 326.166 |
| 1514 | 325.124 |
| 1515 | 324.124 |
| 1516 | 323.124 |
| 1517 | 322.124 |
| 1518 | 321.124 |
| 1519 | 320.124 |
| 1520 | 319.124 |
| 1521 | 318.124 |
| 1522 | 317.124 |
| 1523 | 316.124 |
| 1524 | 315.106 |
| 1525 | 323.528 |
| 1526 | 322.51 |
| 1527 | 321.492 |
| 1528 | 320.474 |
| 1529 | 323.051 |
| 1530 | 322.047 |
| 1531 | 321.044 |
| 1532 | 320.044 |
| 1533 | 319.044 |
| 1534 | 318.044 |
| 1535 | 317.044 |
| 1536 | 316.044 |
| 1537 | 315.044 |
| 1538 | 314.044 |
| 1539 | 312.952 |
| 1540 | 311.859 |
| 1541 | 310.766 |
| 1542 | 332.264 |
| 1543 | 331.264 |
| 1544 | 330.264 |
| 1545 | 329.264 |
| 1546 | 328.264 |
| 1547 | 327.264 |
| 1548 | 326.074 |
| 1549 | 324.884 |
| 1550 | 355.354 |
| 1551 | 354.354 |
| 1552 | 353.354 |
| 1553 | 352.354 |
| 1554 | 351.354 |
| 1555 | 350.354 |
| 1556 | 349.354 |
| 1557 | 348.354 |
| 1558 | 347.312 |
| 1559 | 346.269 |
| 1560 | 345.226 |
| 1561 | 356.684 |
| 1562 | 355.684 |
| 1563 | 354.684 |
| 1564 | 353.684 |
| 1565 | 352.684 |
| 1566 | 351.504 |
| 1567 | 370.504 |
| 1568 | 369.504 |
| 1569 | 368.504 |
| 1570 | 367.504 |
| 1571 | 366.504 |
| 1572 | 365.504 |
| 1573 | 370.494 |
| 1574 | 369.484 |
| 1575 | 368.474 |
| 1576 | 367.464 |
| 1577 | 366.412 |
| 1578 | 365.36 |
| 1579 | 382.308 |
| 1580 | 381.256 |
| 1581 | 380.204 |
| 1582 | 379.204 |
| 1583 | 378.204 |
| 1584 | 377.204 |
| 1585 | 376.204 |
| 1586 | 375.204 |
| 1587 | 374.204 |
| 1588 | 373.204 |
| 1589 | 372.204 |
| 1590 | 371.204 |
| 1591 | 370.204 |
| 1592 | 369.178 |
| 1593 | 379.652 |
| 1594 | 378.626 |
| 1595 | 377.6 |
| 1596 | 376.574 |
| 1597 | 375.574 |
| 1598 | 374.574 |
| 1599 | 373.574 |
| 1600 | 372.574 |
| 1601 | 371.574 |
| 1602 | 370.574 |
| 1603 | 369.574 |
| 1604 | 368.574 |
| 1605 | 367.574 |
| 1606 | 366.574 |
| 1607 | 365.574 |
| 1608 | 364.574 |
| 1609 | 363.574 |
| 1610 | 362.574 |
| 1611 | 361.574 |
| 1612 | 360.574 |
| 1613 | 359.574 |
| 1614 | 358.574 |
| 1615 | 357.574 |
| 1616 | 356.574 |
| 1617 | 355.556 |
| 1618 | 354.538 |
| 1619 | 362.84 |
| 1620 | 361.822 |
| 1621 | 360.804 |
| 1622 | 359.804 |
| 1623 | 358.804 |
| 1624 | 357.804 |
| 1625 | 356.804 |
| 1626 | 355.804 |
| 1627 | 354.804 |
| 1628 | 353.804 |
| 1629 | 352.804 |
| 1630 | 351.804 |
| 1631 | 350.804 |
| 1632 | 349.804 |
| 1633 | 348.804 |
| 1634 | 347.804 |
| 1635 | 350.884 |
| 1636 | 349.864 |
| 1637 | 348.864 |
| 1638 | 347.864 |
| 1639 | 346.864 |
| 1640 | 345.864 |
| 1641 | 344.864 |
| 1642 | 343.864 |
| 1643 | 342.864 |
| 1644 | 341.864 |
| 1645 | 340.864 |
| 1646 | 339.864 |
| 1647 | 338.864 |
| 1648 | 337.864 |
| 1649 | 336.864 |
| 1650 | 335.864 |
| 1651 | 334.864 |
| 1652 | 333.864 |
| 1653 | 332.864 |
| 1654 | 331.864 |
| 1655 | 330.864 |
| 1656 | 329.864 |
| 1657 | 328.864 |
| 1658 | 327.864 |
| 1659 | 326.864 |
| 1660 | 325.864 |
| 1661 | 324.864 |
| 1662 | 323.864 |
| 1663 | 322.864 |
| 1664 | 321.864 |
| 1665 | 320.864 |
| 1666 | 319.864 |
| 1667 | 326.454 |
| 1668 | 325.444 |
| 1669 | 324.434 |
| 1670 | 323.424 |
| 1671 | 322.414 |
| 1672 | 321.414 |
| 1673 | 320.414 |
| 1674 | 319.414 |
| 1675 | 318.414 |
| 1676 | 317.414 |
| 1677 | 316.414 |
| 1678 | 315.414 |
| 1679 | 314.339 |
| 1680 | 322.574 |
| 1681 | 321.574 |
| 1682 | 320.574 |
| 1683 | 319.574 |
| 1684 | 318.574 |
| 1685 | 317.574 |
| 1686 | 316.512 |
| 1687 | 315.45 |
| 1688 | 314.388 |
| 1689 | 333.726 |
| 1690 | 332.664 |
| 1691 | 331.664 |
| 1692 | 330.664 |
| 1693 | 329.664 |
| 1694 | 328.664 |
| 1695 | 327.664 |
| 1696 | 326.664 |
| 1697 | 325.664 |
| 1698 | 324.664 |
| 1699 | 323.664 |
| 1700 | 322.664 |
| 1701 | 321.664 |
| 1702 | 320.664 |
| 1703 | 319.664 |
| 1704 | 318.664 |
| 1705 | 317.664 |
| 1706 | 316.664 |
| 1707 | 315.664 |
| 1708 | 314.664 |
| 1709 | 313.664 |
| 1710 | 312.632 |
| 1711 | 311.6 |
| 1712 | 323.568 |
| 1713 | 322.536 |
| 1714 | 321.504 |
| 1715 | 320.464 |
| 1716 | 325.304 |
| 1717 | 324.304 |
| 1718 | 323.304 |
| 1719 | 322.304 |
| 1720 | 321.304 |
| 1721 | 320.304 |
| 1722 | 319.304 |
| 1723 | 318.304 |
| 1724 | 317.304 |
| 1725 | 316.304 |
| 1726 | 315.304 |
| 1727 | 314.304 |
| 1728 | 313.304 |
| 1729 | 312.304 |
| 1730 | 311.304 |
| 1731 | 310.304 |
| 1732 | 309.304 |
| 1733 | 308.304 |
| 1734 | 307.304 |
| 1735 | 306.304 |
| 1736 | 305.304 |
| 1737 | 304.304 |
| 1738 | 303.304 |
| 1739 | 302.304 |
| 1740 | 301.304 |
| 1741 | 300.304 |
| 1742 | 299.304 |
| 1743 | 298.304 |
| 1744 | 297.304 |
| 1745 | 296.304 |
| 1746 | 295.304 |
| 1747 | 294.304 |
| 1748 | 293.304 |
| 1749 | 292.304 |
| 1750 | 291.304 |
| 1751 | 290.304 |
| 1752 | 289.304 |
| 1753 | 288.304 |
| 1754 | 287.304 |
| 1755 | 286.259 |
| 1756 | 298.324 |
| 1757 | 297.279 |
| 1758 | 296.234 |
| 1759 | 295.234 |
| 1760 | 294.234 |
| 1761 | 293.234 |
| 1762 | 292.234 |
| 1763 | 291.234 |
| 1764 | 298.82 |
| 1765 | 297.806 |
| 1766 | 296.792 |
| 1767 | 295.778 |
| 1768 | 294.764 |
| 1769 | 293.764 |
| 1770 | 292.764 |
| 1771 | 291.764 |
| 1772 | 290.764 |
| 1773 | 289.764 |
| 1774 | 288.764 |
| 1775 | 287.764 |
| 1776 | 286.764 |
| 1777 | 293.144 |
| 1778 | 292.134 |
| 1779 | 291.124 |
| 1780 | 290.114 |
| 1781 | 289.104 |
| 1782 | 292.502 |
| 1783 | 291.499 |
| 1784 | 290.496 |
| 1785 | 289.494 |
| 1786 | 288.494 |
| 1787 | 287.494 |
| 1788 | 286.494 |
| 1789 | 285.494 |
| 1790 | 284.494 |
| 1791 | 283.446 |
| 1792 | 282.399 |
| 1793 | 294.852 |
| 1794 | 293.804 |
| 1795 | 292.804 |
| 1796 | 291.804 |
| 1797 | 290.804 |
| 1798 | 289.804 |
| 1799 | 288.804 |
| 1800 | 287.804 |
| 1801 | 286.804 |
| 1802 | 285.804 |
| 1803 | 284.804 |
| 1804 | 283.804 |
| 1805 | 282.774 |
| 1806 | 281.744 |
| 1807 | 280.714 |
| 1808 | 292.184 |
| 1809 | 291.154 |
| 1810 | 290.104 |
| 1811 | 289.054 |
| 1812 | 288.004 |
| 1813 | 286.954 |
| 1814 | 303.404 |
| 1815 | 302.404 |
| 1816 | 301.404 |
| 1817 | 300.404 |
| 1818 | 299.404 |
| 1819 | 303.204 |
| 1820 | 302.204 |
| 1821 | 301.204 |
| 1822 | 300.204 |
| 1823 | 299.204 |
| 1824 | 298.124 |
| 1825 | 297.044 |
| 1826 | 295.964 |
| 1827 | 319.884 |
| 1828 | 318.804 |
| 1829 | 317.804 |
| 1830 | 316.804 |
| 1831 | 315.804 |
| 1832 | 314.804 |
| 1833 | 313.804 |
| 1834 | 321.09 |
| 1835 | 320.076 |
| 1836 | 319.062 |
| 1837 | 318.048 |
| 1838 | 317.034 |
| 1839 | 316.034 |
| 1840 | 315.034 |
| 1841 | 314.034 |
| 1842 | 313.034 |
| 1843 | 312.034 |
| 1844 | 311.014 |
| 1845 | 319.994 |
| 1846 | 318.974 |
| 1847 | 317.954 |
| 1848 | 316.934 |
| 1849 | 325.246 |
| 1850 | 324.228 |
| 1851 | 323.21 |
| 1852 | 322.192 |
| 1853 | 321.174 |
| 1854 | 320.174 |
| 1855 | 319.174 |
| 1856 | 318.174 |
| 1857 | 317.174 |
| 1858 | 316.174 |
| 1859 | 315.174 |
| 1860 | 314.174 |
| 1861 | 313.174 |
| 1862 | 312.174 |
| 1863 | 311.174 |
| 1864 | 310.174 |
| 1865 | 309.174 |
| 1866 | 308.174 |
| 1867 | 307.174 |
| 1868 | 306.174 |
| 1869 | 305.174 |
| 1870 | 304.174 |
| 1871 | 303.174 |
| 1872 | 302.174 |
| 1873 | 301.174 |
| 1874 | 300.174 |
| 1875 | 299.174 |
| 1876 | 298.174 |
| 1877 | 297.174 |
| 1878 | 296.174 |
| 1879 | 295.174 |
| 1880 | 294.174 |
| 1881 | 293.174 |
| 1882 | 292.174 |
| 1883 | 291.174 |
| 1884 | 290.14 |
| 1885 | 289.106 |
| 1886 | 301.572 |
| 1887 | 300.538 |
| 1888 | 299.504 |
| 1889 | 298.504 |
| 1890 | 297.504 |
| 1891 | 296.504 |
| 1892 | 295.504 |
| 1893 | 294.504 |
| 1894 | 293.484 |
| 1895 | 292.464 |
| 1896 | 301.444 |
| 1897 | 300.424 |
| 1898 | 299.404 |
| 1899 | 298.304 |
| 1900 | 309.164 |
| 1901 | 308.164 |
| 1902 | 307.164 |
| 1903 | 306.164 |
| 1904 | 305.164 |
| 1905 | 304.164 |
| 1906 | 303.164 |
| 1907 | 302.164 |
| 1908 | 301.164 |
| 1909 | 300.164 |
| 1910 | 305.808 |
| 1911 | 304.802 |
| 1912 | 303.796 |
| 1913 | 302.79 |
| 1914 | 301.784 |
| 1915 | 300.784 |
| 1916 | 299.784 |
| 1917 | 298.784 |
| 1918 | 297.784 |
| 1919 | 296.784 |
| 1920 | 295.784 |
| 1921 | 294.784 |
| 1922 | 298.631 |
| 1923 | 297.617 |
| 1924 | 296.604 |
| 1925 | 295.544 |
| 1926 | 294.484 |
| 1927 | 309.594 |
| 1928 | 308.534 |
| 1929 | 307.534 |
| 1930 | 306.534 |
| 1931 | 305.534 |
| 1932 | 304.534 |
| 1933 | 303.534 |
| 1934 | 302.534 |
| 1935 | 301.534 |
| 1936 | 300.534 |
| 1937 | 299.534 |
| 1938 | 298.534 |
| 1939 | 297.534 |
| 1940 | 296.534 |
| 1941 | 295.534 |
| 1942 | 294.534 |
| 1943 | 293.534 |
| 1944 | 292.534 |
| 1945 | 291.534 |
| 1946 | 290.534 |
| 1947 | 297.514 |
| 1948 | 296.494 |
| 1949 | 295.474 |
| 1950 | 294.454 |
| 1951 | 299.42 |
| 1952 | 298.416 |
| 1953 | 297.412 |
| 1954 | 296.408 |
| 1955 | 295.404 |
| 1956 | 294.404 |
| 1957 | 293.404 |
| 1958 | 292.404 |
| 1959 | 291.404 |
| 1960 | 290.404 |
| 1961 | 289.404 |
| 1962 | 288.404 |
| 1963 | 287.404 |
| 1964 | 286.404 |
| 1965 | 285.404 |
| 1966 | 284.404 |
| 1967 | 283.404 |
| 1968 | 282.404 |
| 1969 | 281.404 |
| 1970 | 280.284 |
| 1971 | 300.164 |
| 1972 | 299.044 |
| 1973 | 298.044 |
| 1974 | 297.044 |
| 1975 | 296.044 |
| 1976 | 295.044 |
| 1977 | 294.044 |
| 1978 | 293.044 |
| 1979 | 292.044 |
| 1980 | 291.044 |
| 1981 | 290.044 |
| 1982 | 289.002 |
| 1983 | 287.96 |
| 1984 | 302.418 |
| 1985 | 301.376 |
| 1986 | 300.334 |
| 1987 | 299.334 |
| 1988 | 298.334 |
| 1989 | 297.334 |
| 1990 | 296.334 |
| 1991 | 295.334 |
| 1992 | 294.334 |
| 1993 | 293.334 |
| 1994 | 292.334 |
| 1995 | 291.334 |
| 1996 | 290.334 |
| 1997 | 289.334 |
| 1998 | 288.334 |
| 1999 | 294.824 |
| 2000 | 293.794 |
| 2001 | 292.764 |
| 2002 | 291.764 |
| 2003 | 290.764 |
| 2004 | 289.764 |
| 2005 | 288.764 |
| 2006 | 287.764 |
| 2007 | 286.764 |
| 2008 | 285.764 |
| 2009 | 284.764 |
| 2010 | 283.764 |
| 2011 | 282.764 |
| 2012 | 281.764 |
| 2013 | 280.764 |
| 2014 | 279.764 |
| 2015 | 278.764 |
| 2016 | 277.764 |
| 2017 | 276.764 |
| 2018 | 275.718 |
| 2019 | 274.672 |
| 2020 | 290.316 |
| 2021 | 289.27 |
| 2022 | 288.224 |
| 2023 | 287.224 |
| 2024 | 286.224 |
| 2025 | 285.224 |
| 2026 | 284.224 |
| 2027 | 283.224 |
| 2028 | 282.224 |
| 2029 | 281.224 |
| 2030 | 280.224 |
| 2031 | 289.177 |
| 2032 | 288.131 |
| 2033 | 287.084 |
| 2034 | 286.084 |
| 2035 | 285.084 |
| 2036 | 284.084 |
| 2037 | 283.084 |
| 2038 | 282.084 |
| 2039 | 287.264 |
| 2040 | 286.244 |
| 2041 | 285.224 |
| 2042 | 289.832 |
| 2043 | 288.83 |
| 2044 | 287.828 |
| 2045 | 286.826 |
| 2046 | 285.824 |
| 2047 | 295.454 |
| 2048 | 294.404 |
| 2049 | 293.354 |
| 2050 | 292.291 |
| 2051 | 303.727 |
| 2052 | 302.664 |
| 2053 | 301.624 |
| 2054 | 300.584 |
| 2055 | 299.544 |
| 2056 | 313.554 |
| 2057 | 312.514 |
| 2058 | 311.514 |
| 2059 | 310.514 |
| 2060 | 309.514 |
| 2061 | 308.514 |
| 2062 | 307.514 |
| 2063 | 306.514 |
| 2064 | 305.514 |
| 2065 | 304.514 |
| 2066 | 303.514 |
| 2067 | 302.514 |
| 2068 | 301.514 |
| 2069 | 300.514 |
| 2070 | 299.514 |
| 2071 | 298.514 |
| 2072 | 297.514 |
| 2073 | 296.514 |
| 2074 | 295.514 |
| 2075 | 294.514 |
| 2076 | 293.514 |
| 2077 | 292.514 |
| 2078 | 291.514 |
| 2079 | 290.514 |
| 2080 | 289.514 |
| 2081 | 288.514 |
| 2082 | 287.514 |
| 2083 | 286.514 |
| 2084 | 285.514 |
| 2085 | 284.514 |
| 2086 | 288.812 |
| 2087 | 287.81 |
| 2088 | 286.808 |
| 2089 | 285.806 |
| 2090 | 284.804 |
| 2091 | 283.804 |
| 2092 | 282.804 |
| 2093 | 281.712 |
| 2094 | 280.619 |
| 2095 | 301.877 |
| 2096 | 300.784 |
| 2097 | 304.709 |
| 2098 | 303.704 |
| 2099 | 302.699 |
| 2100 | 301.694 |
| 2101 | 300.694 |
| 2102 | 299.694 |
| 2103 | 298.694 |
| 2104 | 297.694 |
| 2105 | 296.694 |
| 2106 | 295.694 |
| 2107 | 294.694 |
| 2108 | 293.694 |
| 2109 | 292.65 |
| 2110 | 291.606 |
| 2111 | 306.562 |
| 2112 | 305.518 |
| 2113 | 304.474 |
| 2114 | 303.474 |
| 2115 | 302.474 |
| 2116 | 301.474 |
| 2117 | 300.474 |
| 2118 | 307.454 |
| 2119 | 306.434 |
| 2120 | 305.414 |
| 2121 | 304.394 |
| 2122 | 303.394 |
| 2123 | 302.394 |
| 2124 | 301.394 |
| 2125 | 300.394 |
| 2126 | 299.394 |
| 2127 | 298.394 |
| 2128 | 297.394 |
| 2129 | 301.194 |
| 2130 | 300.194 |
| 2131 | 299.194 |
| 2132 | 298.194 |
| 2133 | 297.194 |
| 2134 | 301.374 |
| 2135 | 300.374 |
| 2136 | 299.374 |
| 2137 | 298.374 |
| 2138 | 297.374 |
| 2139 | 296.359 |
| 2140 | 302.344 |
| 2141 | 301.329 |
| 2142 | 300.314 |
| 2143 | 299.314 |
| 2144 | 298.314 |
| 2145 | 297.314 |
| 2146 | 296.314 |
| 2147 | 295.314 |
| 2148 | 294.314 |
| 2149 | 293.314 |
| 2150 | 292.314 |
| 2151 | 291.314 |
| 2152 | 290.314 |
| 2153 | 289.314 |
| 2154 | 288.314 |
| 2155 | 287.221 |
| 2156 | 286.127 |
| 2157 | 301.994 |
| 2158 | 309.39 |
| 2159 | 308.376 |
| 2160 | 307.362 |
| 2161 | 306.348 |
| 2162 | 305.334 |
| 2163 | 304.328 |
| 2164 | 309.812 |
| 2165 | 308.806 |
| 2166 | 307.8 |
| 2167 | 306.794 |
| 2168 | 305.752 |
| 2169 | 320.35 |
| 2170 | 319.308 |
| 2171 | 318.266 |
| 2172 | 317.224 |
| 2173 | 316.224 |
| 2174 | 315.224 |
| 2175 | 314.224 |
| 2176 | 313.224 |
| 2177 | 319.374 |
| 2178 | 318.324 |
| 2179 | 317.324 |
| 2180 | 316.324 |
| 2181 | 315.324 |
| 2182 | 314.324 |
| 2183 | 313.324 |
| 2184 | 312.324 |
| 2185 | 311.324 |
| 2186 | 310.324 |
| 2187 | 309.324 |
| 2188 | 308.324 |
| 2189 | 307.324 |
| 2190 | 306.324 |
| 2191 | 305.324 |
| 2192 | 304.324 |
| 2193 | 303.324 |
| 2194 | 302.324 |
| 2195 | 301.304 |
| 2196 | 310.424 |
| 2197 | 309.404 |
| 2198 | 308.384 |
| 2199 | 307.364 |
| 2200 | 306.364 |
| 2201 | 305.364 |
| 2202 | 304.364 |
| 2203 | 303.364 |
| 2204 | 302.364 |
| 2205 | 301.364 |
| 2206 | 300.364 |
| 2207 | 299.364 |
| 2208 | 298.364 |
| 2209 | 297.364 |
| 2210 | 296.364 |
| 2211 | 295.364 |
| 2212 | 294.364 |
| 2213 | 293.364 |
| 2214 | 292.364 |
| 2215 | 296.917 |
| 2216 | 295.901 |
| 2217 | 294.884 |
| 2218 | 293.83 |
| 2219 | 292.776 |
| 2220 | 309.982 |
| 2221 | 308.928 |
| 2222 | 307.874 |
| 2223 | 306.874 |
| 2224 | 305.874 |
| 2225 | 311.956 |
| 2226 | 310.948 |
| 2227 | 309.94 |
| 2228 | 308.932 |
| 2229 | 307.924 |
| 2230 | 306.924 |
| 2231 | 305.924 |
| 2232 | 304.924 |
| 2233 | 303.924 |
| 2234 | 302.924 |
| 2235 | 301.906 |
| 2236 | 310.458 |
| 2237 | 309.44 |
| 2238 | 308.422 |
| 2239 | 307.404 |
| 2240 | 306.404 |
| 2241 | 305.404 |
| 2242 | 304.404 |
| 2243 | 303.404 |
| 2244 | 302.404 |
| 2245 | 301.404 |
| 2246 | 300.404 |
| 2247 | 299.404 |
| 2248 | 298.404 |
| 2249 | 297.404 |
| 2250 | 296.39 |
| 2251 | 303.776 |
| 2252 | 302.762 |
| 2253 | 301.748 |
| 2254 | 300.734 |
| 2255 | 299.702 |
| 2256 | 298.67 |
| 2257 | 297.638 |
| 2258 | 309.696 |
| 2259 | 308.664 |
| 2260 | 307.664 |
| 2261 | 306.664 |
| 2262 | 305.664 |
| 2263 | 304.664 |
| 2264 | 303.664 |
| 2265 | 302.664 |
| 2266 | 301.664 |
| 2267 | 300.664 |
| 2268 | 299.664 |
| 2269 | 298.664 |
| 2270 | 297.664 |
| 2271 | 296.664 |
| 2272 | 295.664 |
| 2273 | 294.664 |
| 2274 | 293.664 |
| 2275 | 292.664 |
| 2276 | 291.664 |
| 2277 | 290.664 |
| 2278 | 289.664 |
| 2279 | 288.664 |
| 2280 | 287.664 |
| 2281 | 286.664 |
| 2282 | 285.664 |
| 2283 | 284.664 |
| 2284 | 283.664 |
| 2285 | 282.664 |
| 2286 | 281.644 |
| 2287 | 288.764 |
| 2288 | 287.744 |
| 2289 | 286.724 |
| 2290 | 285.7 |
| 2291 | 284.676 |
| 2292 | 294.652 |
| 2293 | 293.628 |
| 2294 | 292.604 |
| 2295 | 291.568 |
| 2296 | 290.532 |
| 2297 | 289.496 |
| 2298 | 302.46 |
| 2299 | 301.424 |
| 2300 | 300.021 |
| 2301 | 298.617 |
| 2302 | 360.504 |
| 2303 | 359.504 |
| 2304 | 358.504 |
| 2305 | 357.504 |
| 2306 | 356.504 |
| 2307 | 355.504 |
| 2308 | 354.504 |
| 2309 | 353.504 |
| 2310 | 352.456 |
| 2311 | 351.408 |
| 2312 | 350.36 |
| 2313 | 366.562 |
| 2314 | 365.514 |
| 2315 | 364.514 |
| 2316 | 363.514 |
| 2317 | 362.514 |
| 2318 | 361.381 |
| 2319 | 383.247 |
| 2320 | 382.114 |
| 2321 | 381.114 |
| 2322 | 380.114 |
| 2323 | 379.114 |
| 2324 | 378.114 |
| 2325 | 377.114 |
| 2326 | 376.084 |
| 2327 | 382.454 |
| 2328 | 381.424 |
| 2329 | 380.424 |
| 2330 | 379.424 |
| 2331 | 378.424 |
| 2332 | 377.424 |
| 2333 | 376.424 |
| 2334 | 375.424 |
| 2335 | 374.424 |
| 2336 | 373.424 |
| 2337 | 372.424 |
| 2338 | 371.424 |
| 2339 | 370.424 |
| 2340 | 374.897 |
| 2341 | 373.889 |
| 2342 | 372.882 |
| 2343 | 371.874 |
| 2344 | 370.842 |
| 2345 | 369.81 |
| 2346 | 381.568 |
| 2347 | 380.536 |
| 2348 | 379.504 |
| 2349 | 378.504 |
| 2350 | 377.504 |
| 2351 | 376.504 |
| 2352 | 375.504 |
| 2353 | 374.504 |
| 2354 | 384.022 |
| 2355 | 383 |
| 2356 | 381.978 |
| 2357 | 380.956 |
| 2358 | 379.934 |
| 2359 | 378.872 |
| 2360 | 377.81 |
| 2361 | 376.748 |
| 2362 | 396.206 |
| 2363 | 395.144 |
| 2364 | 394.144 |
| 2365 | 393.144 |
| 2366 | 392.092 |
| 2367 | 391.04 |
| 2368 | 407.988 |
| 2369 | 406.936 |
| 2370 | 405.884 |
| 2371 | 411.239 |
| 2372 | 410.194 |
| 2373 | 413.792 |
| 2374 | 412.789 |
| 2375 | 411.787 |
| 2376 | 410.784 |
| 2377 | 409.784 |
| 2378 | 408.784 |
| 2379 | 407.784 |
| 2380 | 406.784 |
| 2381 | 405.784 |
| 2382 | 404.784 |
| 2383 | 403.784 |
| 2384 | 402.784 |
| 2385 | 401.784 |
| 2386 | 400.649 |
| 2387 | 399.514 |
| 2388 | 398.379 |
| 2389 | 428.284 |
| 2390 | 427.284 |
| 2391 | 426.284 |
| 2392 | 425.284 |
| 2393 | 424.284 |
| 2394 | 423.284 |
| 2395 | 422.284 |
| 2396 | 421.284 |
| 2397 | 420.284 |
| 2398 | 419.242 |
| 2399 | 418.2 |
| 2400 | 417.158 |
| 2401 | 431.766 |
| 2402 | 430.724 |
| 2403 | 429.724 |
| 2404 | 428.724 |
| 2405 | 427.724 |
| 2406 | 426.724 |
| 2407 | 425.724 |
| 2408 | 424.724 |
| 2409 | 423.724 |
| 2410 | 422.724 |
| 2411 | 421.724 |
| 2412 | 420.724 |
| 2413 | 419.724 |
| 2414 | 418.724 |
| 2415 | 417.724 |
| 2416 | 416.724 |
| 2417 | 415.724 |
| 2418 | 414.724 |
| 2419 | 413.724 |
| 2420 | 421.504 |
| 2421 | 420.484 |
| 2422 | 419.464 |
| 2423 | 418.444 |
| 2424 | 417.444 |
| 2425 | 416.444 |
| 2426 | 415.444 |
| 2427 | 421.197 |
| 2428 | 420.171 |
| 2429 | 419.144 |
| 2430 | 418.144 |
| 2431 | 417.144 |
| 2432 | 416.144 |
| 2433 | 415.144 |
| 2434 | 414.144 |
| 2435 | 413.144 |
| 2436 | 412.144 |
| 2437 | 411.144 |
| 2438 | 410.144 |
| 2439 | 409.144 |
| 2440 | 408.144 |
| 2441 | 407.144 |
| 2442 | 406.076 |
| 2443 | 405.008 |
| 2444 | 403.94 |
| 2445 | 402.872 |
| 2446 | 423.624 |
| 2447 | 422.624 |
| 2448 | 421.624 |
| 2449 | 420.624 |
| 2450 | 419.624 |
| 2451 | 418.624 |
| 2452 | 417.624 |
| 2453 | 416.624 |
| 2454 | 415.514 |
| 2455 | 414.404 |
| 2456 | 413.294 |
| 2457 | 438.184 |
| 2458 | 437.184 |
| 2459 | 436.184 |
| 2460 | 435.184 |
| 2461 | 434.184 |
| 2462 | 433.184 |
| 2463 | 432.184 |
| 2464 | 431.184 |
| 2465 | 430.184 |
| 2466 | 429.184 |
| 2467 | 428.184 |
| 2468 | 427.184 |
| 2469 | 426.184 |
| 2470 | 424.889 |
| 2471 | 455.074 |
| 2472 | 454.074 |
| 2473 | 453.074 |
| 2474 | 452.074 |
| 2475 | 451.074 |
| 2476 | 450.074 |
| 2477 | 449.074 |
| 2478 | 448.074 |
| 2479 | 447.074 |
| 2480 | 446.074 |
| 2481 | 452.444 |
| 2482 | 451.414 |
| 2483 | 450.384 |
| 2484 | 457.481 |
| 2485 | 456.447 |
| 2486 | 455.414 |
| 2487 | 459.509 |
| 2488 | 458.504 |
| 2489 | 457.499 |
| 2490 | 456.494 |
| 2491 | 455.494 |
| 2492 | 454.494 |
| 2493 | 453.494 |
| 2494 | 452.494 |
| 2495 | 451.494 |
| 2496 | 450.494 |
| 2497 | 449.486 |
| 2498 | 455.468 |
| 2499 | 454.46 |
| 2500 | 453.452 |
| 2501 | 452.444 |
| 2502 | 451.444 |
| 2503 | 450.444 |
| 2504 | 449.444 |
| 2505 | 448.444 |
| 2506 | 447.444 |
| 2507 | 446.444 |
| 2508 | 445.444 |
| 2509 | 444.444 |
| 2510 | 443.444 |
| 2511 | 442.444 |
| 2512 | 441.444 |
| 2513 | 440.444 |
| 2514 | 439.444 |
| 2515 | 438.444 |
| 2516 | 437.444 |
| 2517 | 436.444 |
| 2518 | 435.444 |
| 2519 | 434.444 |
| 2520 | 433.444 |
| 2521 | 432.444 |
| 2522 | 431.444 |
| 2523 | 430.444 |
| 2524 | 429.444 |
| 2525 | 428.444 |
| 2526 | 427.444 |
| 2527 | 426.444 |
| 2528 | 425.444 |
| 2529 | 424.444 |
| 2530 | 423.444 |
| 2531 | 422.444 |
| 2532 | 421.444 |
| 2533 | 420.444 |
| 2534 | 419.444 |
| 2535 | 418.444 |
| 2536 | 417.444 |
| 2537 | 416.444 |
| 2538 | 415.444 |
| 2539 | 414.444 |
| 2540 | 413.444 |
| 2541 | 412.444 |
| 2542 | 411.444 |
| 2543 | 410.444 |
| 2544 | 409.444 |
| 2545 | 408.444 |
| 2546 | 407.444 |
| 2547 | 406.444 |
| 2548 | 405.444 |
| 2549 | 404.444 |
| 2550 | 403.444 |
| 2551 | 402.444 |
| 2552 | 401.444 |
| 2553 | 400.444 |
| 2554 | 399.444 |
| 2555 | 398.444 |
| 2556 | 397.444 |
| 2557 | 396.444 |
| 2558 | 395.444 |
| 2559 | 394.444 |
| 2560 | 393.444 |
| 2561 | 392.444 |
| 2562 | 391.444 |
| 2563 | 390.444 |
| 2564 | 389.444 |
| 2565 | 388.444 |
| 2566 | 387.428 |
| 2567 | 395.192 |
| 2568 | 394.176 |
| 2569 | 393.16 |
| 2570 | 392.144 |
| 2571 | 391.144 |
| 2572 | 390.144 |
| 2573 | 389.144 |
| 2574 | 388.144 |
| 2575 | 387.144 |
| 2576 | 391.119 |
| 2577 | 390.114 |
| 2578 | 389.109 |
| 2579 | 388.104 |
| 2580 | 387.042 |
| 2581 | 385.98 |
| 2582 | 384.918 |
| 2583 | 383.856 |
| 2584 | 403.424 |
| 2585 | 402.38 |
| 2586 | 401.336 |
| 2587 | 416.242 |
| 2588 | 415.198 |
| 2589 | 414.154 |
| 2590 | 413.154 |
| 2591 | 412.154 |
| 2592 | 411.154 |
| 2593 | 410.154 |
| 2594 | 409.154 |
| 2595 | 416.142 |
| 2596 | 415.13 |
| 2597 | 414.118 |
| 2598 | 413.106 |
| 2599 | 412.094 |
| 2600 | 411.094 |
| 2601 | 410.094 |
| 2602 | 409.094 |
| 2603 | 408.094 |
| 2604 | 407.094 |
| 2605 | 406.094 |
| 2606 | 405.094 |
| 2607 | 404.094 |
| 2608 | 403.094 |
| 2609 | 402.094 |
| 2610 | 401.094 |
| 2611 | 419.354 |
| 2612 | 418.244 |
| 2613 | 417.134 |
| 2614 | 416.134 |
| 2615 | 415.134 |
| 2616 | 414.134 |
| 2617 | 413.134 |
| 2618 | 412.091 |
| 2619 | 420.367 |
| 2620 | 419.324 |
| 2621 | 418.257 |
| 2622 | 417.189 |
| 2623 | 433.422 |
| 2624 | 432.354 |
| 2625 | 431.354 |
| 2626 | 430.354 |
| 2627 | 429.354 |
| 2628 | 428.354 |
| 2629 | 434.012 |
| 2630 | 432.999 |
| 2631 | 431.987 |
| 2632 | 430.974 |
| 2633 | 429.974 |
| 2634 | 428.974 |
| 2635 | 427.974 |
| 2636 | 426.974 |
| 2637 | 425.974 |
| 2638 | 424.974 |
| 2639 | 423.974 |
| 2640 | 422.974 |
| 2641 | 421.974 |
| 2642 | 420.974 |
| 2643 | 424.344 |
| 2644 | 423.344 |
| 2645 | 422.344 |
| 2646 | 421.344 |
| 2647 | 420.344 |
| 2648 | 419.344 |
| 2649 | 418.344 |
| 2650 | 417.344 |
| 2651 | 416.344 |
| 2652 | 415.344 |
| 2653 | 414.344 |
| 2654 | 413.344 |
| 2655 | 412.344 |
| 2656 | 411.344 |
| 2657 | 414.742 |
| 2658 | 413.739 |
| 2659 | 412.737 |
| 2660 | 411.734 |
| 2661 | 410.702 |
| 2662 | 409.67 |
| 2663 | 421.638 |
| 2664 | 420.606 |
| 2665 | 419.574 |
| 2666 | 418.574 |
| 2667 | 417.574 |
| 2668 | 425.947 |
| 2669 | 424.919 |
| 2670 | 423.892 |
| 2671 | 422.864 |
| 2672 | 421.864 |
| 2673 | 420.864 |
| 2674 | 419.864 |
| 2675 | 418.864 |
| 2676 | 417.864 |
| 2677 | 416.864 |
| 2678 | 415.864 |
| 2679 | 414.864 |
| 2680 | 413.864 |
| 2681 | 412.827 |
| 2682 | 411.791 |
| 2683 | 419.274 |
| 2684 | 418.274 |
| 2685 | 417.274 |
| 2686 | 416.274 |
| 2687 | 415.274 |
| 2688 | 414.274 |
| 2689 | 413.207 |
| 2690 | 412.139 |
| 2691 | 428.572 |
| 2692 | 427.504 |
| 2693 | 426.484 |
| 2694 | 425.464 |
| 2695 | 432.324 |
| 2696 | 431.304 |
| 2697 | 430.304 |
| 2698 | 429.304 |
| 2699 | 428.304 |
| 2700 | 427.304 |
| 2701 | 426.304 |
| 2702 | 425.304 |
| 2703 | 424.304 |
| 2704 | 423.304 |
| 2705 | 422.304 |
| 2706 | 421.304 |
| 2707 | 424.014 |
| 2708 | 423.014 |
| 2709 | 422.014 |
| 2710 | 421.014 |
| 2711 | 426.787 |
| 2712 | 425.761 |
| 2713 | 424.734 |
| 2714 | 423.734 |
| 2715 | 422.734 |
| 2716 | 421.734 |
| 2717 | 420.734 |
| 2718 | 419.734 |
| 2719 | 418.734 |
| 2720 | 417.734 |
| 2721 | 416.734 |
| 2722 | 425.714 |
| 2723 | 424.694 |
| 2724 | 423.674 |
| 2725 | 422.654 |
| 2726 | 421.634 |
| 2727 | 420.634 |
| 2728 | 419.634 |
| 2729 | 418.634 |
| 2730 | 417.634 |
| 2731 | 424.91 |
| 2732 | 423.896 |
| 2733 | 422.882 |
| 2734 | 421.868 |
| 2735 | 420.854 |
| 2736 | 419.854 |
| 2737 | 418.854 |
| 2738 | 417.854 |
| 2739 | 416.854 |
| 2740 | 415.854 |
| 2741 | 414.854 |
| 2742 | 413.854 |
| 2743 | 412.854 |
| 2744 | 411.854 |
| 2745 | 410.854 |
| 2746 | 409.854 |
| 2747 | 408.854 |
| 2748 | 407.854 |
| 2749 | 406.854 |
| 2750 | 405.854 |
| 2751 | 404.854 |
| 2752 | 403.854 |
| 2753 | 402.822 |
| 2754 | 401.79 |
| 2755 | 413.968 |
| 2756 | 412.936 |
| 2757 | 411.904 |
| 2758 | 410.904 |
| 2759 | 409.904 |
| 2760 | 408.904 |
| 2761 | 407.904 |
| 2762 | 406.904 |
| 2763 | 405.904 |
| 2764 | 404.904 |
| 2765 | 403.904 |
| 2766 | 402.904 |
| 2767 | 413.259 |
| 2768 | 412.164 |
| 2769 | 411.164 |
| 2770 | 410.164 |
| 2771 | 409.164 |
| 2772 | 408.164 |
| 2773 | 407.164 |
| 2774 | 406.086 |
| 2775 | 405.008 |
| 2776 | 403.93 |
| 2777 | 402.852 |
| 2778 | 426.484 |
| 2779 | 425.484 |
| 2780 | 424.484 |
| 2781 | 423.484 |
| 2782 | 422.484 |
| 2783 | 421.484 |
| 2784 | 420.437 |
| 2785 | 419.389 |
| 2786 | 431.712 |
| 2787 | 430.664 |
| 2788 | 429.664 |
| 2789 | 428.664 |
| 2790 | 427.664 |
| 2791 | 426.647 |
| 2792 | 431.241 |
| 2793 | 430.224 |
| 2794 | 429.224 |
| 2795 | 428.224 |
| 2796 | 427.224 |
| 2797 | 426.224 |
| 2798 | 425.224 |
| 2799 | 433.559 |
| 2800 | 432.484 |
| 2801 | 431.484 |
| 2802 | 430.484 |
| 2803 | 429.43 |
| 2804 | 428.376 |
| 2805 | 427.322 |
| 2806 | 444.928 |
| 2807 | 443.874 |
| 2808 | 442.862 |
| 2809 | 449.85 |
| 2810 | 448.838 |
| 2811 | 447.826 |
| 2812 | 446.814 |
| 2813 | 454.25 |
| 2814 | 453.236 |
| 2815 | 452.222 |
| 2816 | 451.208 |
| 2817 | 450.194 |
| 2818 | 449.194 |
| 2819 | 448.194 |
| 2820 | 447.194 |
| 2821 | 446.194 |
| 2822 | 445.194 |
| 2823 | 450.394 |
| 2824 | 449.384 |
| 2825 | 448.374 |
| 2826 | 447.364 |
| 2827 | 446.34 |
| 2828 | 445.316 |
| 2829 | 455.292 |
| 2830 | 454.268 |
| 2831 | 453.244 |
| 2832 | 452.244 |
| 2833 | 451.244 |
| 2834 | 456.652 |
| 2835 | 455.639 |
| 2836 | 454.627 |
| 2837 | 453.614 |
| 2838 | 457.381 |
| 2839 | 456.367 |
| 2840 | 455.354 |
| 2841 | 454.354 |
| 2842 | 453.354 |
| 2843 | 452.354 |
| 2844 | 451.354 |
| 2845 | 450.354 |
| 2846 | 449.354 |
| 2847 | 448.354 |
| 2848 | 447.354 |
| 2849 | 446.354 |
| 2850 | 445.354 |
| 2851 | 444.354 |
| 2852 | 443.354 |
| 2853 | 442.354 |
| 2854 | 441.354 |
| 2855 | 440.354 |
| 2856 | 439.354 |
| 2857 | 438.354 |
| 2858 | 437.354 |
| 2859 | 436.354 |
| 2860 | 435.354 |
| 2861 | 434.354 |
| 2862 | 433.354 |
| 2863 | 432.354 |
| 2864 | 431.354 |
| 2865 | 430.354 |
| 2866 | 429.354 |
| 2867 | 428.354 |
| 2868 | 427.354 |
| 2869 | 426.354 |
| 2870 | 425.354 |
| 2871 | 424.354 |
| 2872 | 423.354 |
| 2873 | 422.354 |
| 2874 | 421.354 |
| 2875 | 420.354 |
| 2876 | 419.354 |
| 2877 | 418.354 |
| 2878 | 417.354 |
| 2879 | 416.354 |
| 2880 | 415.354 |
| 2881 | 414.354 |
| 2882 | 413.354 |
| 2883 | 412.354 |
| 2884 | 422.264 |
| 2885 | 421.174 |
| 2886 | 420.174 |
| 2887 | 419.174 |
| 2888 | 418.174 |
| 2889 | 417.174 |
| 2890 | 416.174 |
| 2891 | 415.174 |
| 2892 | 414.174 |
| 2893 | 413.174 |
| 2894 | 412.174 |
| 2895 | 411.174 |
| 2896 | 410.174 |
| 2897 | 409.174 |
| 2898 | 408.174 |
| 2899 | 407.174 |
| 2900 | 406.174 |
| 2901 | 405.174 |
| 2902 | 404.174 |
| 2903 | 403.132 |
| 2904 | 402.09 |
| 2905 | 401.048 |
| 2906 | 400.006 |
| 2907 | 414.474 |
| 2908 | 413.474 |
| 2909 | 412.474 |
| 2910 | 416.107 |
| 2911 | 415.099 |
| 2912 | 414.092 |
| 2913 | 413.072 |
| 2914 | 422.102 |
| 2915 | 421.082 |
| 2916 | 420.062 |
| 2917 | 419.042 |
| 2918 | 435.722 |
| 2919 | 434.672 |
| 2920 | 433.622 |
| 2921 | 432.572 |
| 2922 | 431.522 |
| 2923 | 430.452 |
| 2924 | 429.382 |
| 2925 | 428.312 |
| 2926 | 445.372 |
| 2927 | 444.372 |
| 2928 | 443.372 |
| 2929 | 442.372 |
| 2930 | 441.372 |
| 2931 | 440.372 |
| 2932 | 445.558 |
| 2933 | 444.554 |
| 2934 | 443.55 |
| 2935 | 442.546 |
| 2936 | 441.542 |
| 2937 | 440.502 |
| 2938 | 439.462 |
| 2939 | 447.202 |
| 2940 | 446.202 |
| 2941 | 445.202 |
| 2942 | 444.202 |
| 2943 | 443.202 |
| 2944 | 442.202 |
| 2945 | 441.202 |
| 2946 | 440.202 |
| 2947 | 439.202 |
| 2948 | 438.202 |
| 2949 | 437.202 |
| 2950 | 436.202 |
| 2951 | 435.202 |
| 2952 | 434.202 |
| 2953 | 433.202 |
| 2954 | 432.202 |
| 2955 | 431.202 |
| 2956 | 434.467 |
| 2957 | 433.442 |
| 2958 | 432.442 |
| 2959 | 431.442 |
| 2960 | 430.442 |
| 2961 | 429.442 |
| 2962 | 428.442 |
| 2963 | 427.442 |
| 2964 | 426.442 |
| 2965 | 425.442 |
| 2966 | 424.442 |
| 2967 | 423.442 |
| 2968 | 422.442 |
| 2969 | 421.442 |
| 2970 | 420.442 |
| 2971 | 419.442 |
| 2972 | 418.442 |
| 2973 | 417.442 |
| 2974 | 431.402 |
| 2975 | 430.362 |
| 2976 | 429.322 |
| 2977 | 428.282 |
| 2978 | 427.242 |
| 2979 | 426.188 |
| 2980 | 425.135 |
| 2981 | 435.082 |
| 2982 | 445.018 |
| 2983 | 443.994 |
| 2984 | 442.97 |
| 2985 | 441.946 |
| 2986 | 440.922 |
| 2987 | 439.922 |
| 2988 | 438.922 |
| 2989 | 437.922 |
| 2990 | 436.922 |
| 2991 | 435.922 |
| 2992 | 434.922 |
| 2993 | 433.922 |
| 2994 | 432.922 |
| 2995 | 431.922 |
| 2996 | 430.89 |
| 2997 | 429.858 |
| 2998 | 441.636 |
| 2999 | 440.604 |
| 3000 | 439.572 |
| 3001 | 438.572 |
| 3002 | 437.572 |
| 3003 | 436.572 |
| 3004 | 435.572 |
| 3005 | 434.572 |
| 3006 | 433.572 |
| 3007 | 432.572 |
| 3008 | 431.572 |
| 3009 | 430.572 |
| 3010 | 429.572 |
| 3011 | 428.572 |
| 3012 | 427.572 |
| 3013 | 426.572 |
| 3014 | 425.572 |
| 3015 | 429.758 |
| 3016 | 428.745 |
| 3017 | 427.732 |
| 3018 | 426.732 |
| 3019 | 425.732 |
| 3020 | 424.658 |
| 3021 | 437.585 |
| 3022 | 436.512 |
| 3023 | 435.512 |
| 3024 | 434.512 |
| 3025 | 433.512 |
| 3026 | 432.512 |
| 3027 | 431.512 |
| 3028 | 430.454 |
| 3029 | 429.397 |
| 3030 | 443.809 |
| 3031 | 442.752 |
| 3032 | 441.724 |
| 3033 | 452.896 |
| 3034 | 451.868 |
| 3035 | 450.84 |
| 3036 | 449.812 |
| 3037 | 448.769 |
| 3038 | 447.727 |
| 3039 | 459.184 |
| 3040 | 458.142 |
| 3041 | 457.142 |
| 3042 | 456.142 |
| 3043 | 455.142 |
| 3044 | 454.142 |
| 3045 | 453.142 |
| 3046 | 452.142 |
| 3047 | 451.142 |
| 3048 | 450.142 |
| 3049 | 449.142 |
| 3050 | 448.142 |
| 3051 | 447.142 |
| 3052 | 446.142 |
| 3053 | 451.242 |
| 3054 | 450.232 |
| 3055 | 449.222 |
| 3056 | 448.212 |
| 3057 | 447.212 |
| 3058 | 446.212 |
| 3059 | 445.212 |
| 3060 | 444.212 |
| 3061 | 443.212 |
| 3062 | 442.212 |
| 3063 | 441.212 |
| 3064 | 440.212 |
| 3065 | 439.166 |
| 3066 | 438.12 |
| 3067 | 437.074 |
| 3068 | 452.528 |
| 3069 | 451.482 |
| 3070 | 450.482 |
| 3071 | 449.482 |
| 3072 | 448.482 |
| 3073 | 447.482 |
| 3074 | 446.442 |
| 3075 | 445.402 |
| 3076 | 459.552 |
| 3077 | 458.512 |
| 3078 | 457.472 |
| 3079 | 456.422 |
| 3080 | 469.562 |
| 3081 | 468.512 |
| 3082 | 467.462 |
| 3083 | 466.462 |
| 3084 | 465.462 |
| 3085 | 464.462 |
| 3086 | 463.426 |
| 3087 | 462.39 |
| 3088 | 475.104 |
| 3089 | 474.068 |
| 3090 | 473.032 |
| 3091 | 486.449 |
| 3092 | 485.397 |
| 3093 | 484.344 |
| 3094 | 483.292 |
| 3095 | 482.292 |
| 3096 | 481.292 |
| 3097 | 480.292 |
| 3098 | 479.292 |
| 3099 | 478.292 |
| 3100 | 477.292 |
| 3101 | 476.292 |
| 3102 | 475.292 |
| 3103 | 474.292 |
| 3104 | 473.292 |
| 3105 | 472.292 |
| 3106 | 471.292 |
| 3107 | 470.292 |
| 3108 | 469.292 |
| 3109 | 468.292 |
| 3110 | 467.252 |
| 3111 | 472.182 |
| 3112 | 471.182 |
| 3113 | 470.182 |
| 3114 | 478.236 |
| 3115 | 477.22 |
| 3116 | 476.204 |
| 3117 | 475.188 |
| 3118 | 474.172 |
| 3119 | 473.172 |
| 3120 | 472.172 |
| 3121 | 471.172 |
| 3122 | 470.172 |
| 3123 | 469.172 |
| 3124 | 468.172 |
| 3125 | 467.172 |
| 3126 | 466.172 |
| 3127 | 465.172 |
| 3128 | 464.172 |
| 3129 | 463.172 |
| 3130 | 471.377 |
| 3131 | 470.352 |
| 3132 | 469.327 |
| 3133 | 468.302 |
| 3134 | 478.745 |
| 3135 | 477.688 |
| 3136 | 476.632 |
| 3137 | 487.316 |
| 3138 | 486.29 |
| 3139 | 485.264 |
| 3140 | 484.238 |
| 3141 | 483.212 |
| 3142 | 482.212 |
| 3143 | 481.212 |
| 3144 | 480.212 |
| 3145 | 479.212 |
| 3146 | 478.212 |
| 3147 | 477.212 |
| 3148 | 476.212 |
| 3149 | 475.212 |
| 3150 | 474.212 |
| 3151 | 473.212 |
| 3152 | 472.212 |
| 3153 | 471.212 |
| 3154 | 470.212 |
| 3155 | 469.212 |
| 3156 | 468.178 |
| 3157 | 475.375 |
| 3158 | 474.342 |
| 3159 | 473.342 |
| 3160 | 472.342 |
| 3161 | 471.342 |
| 3162 | 470.342 |
| 3163 | 469.342 |
| 3164 | 468.342 |
| 3165 | 467.342 |
| 3166 | 466.342 |
| 3167 | 465.342 |
| 3168 | 464.342 |
| 3169 | 463.342 |
| 3170 | 462.342 |
| 3171 | 461.342 |
| 3172 | 460.307 |
| 3173 | 470.232 |
| 3174 | 469.197 |
| 3175 | 468.162 |
| 3176 | 467.162 |
| 3177 | 466.162 |
| 3178 | 465.162 |
| 3179 | 464.162 |
| 3180 | 463.162 |
| 3181 | 462.162 |
| 3182 | 461.162 |
| 3183 | 460.162 |
| 3184 | 459.144 |
| 3185 | 465.777 |
| 3186 | 464.759 |
| 3187 | 463.742 |
| 3188 | 462.742 |
| 3189 | 461.742 |
| 3190 | 460.742 |
| 3191 | 459.742 |
| 3192 | 458.742 |
| 3193 | 457.742 |
| 3194 | 456.742 |
| 3195 | 455.717 |
| 3196 | 463.692 |
| 3197 | 462.667 |
| 3198 | 461.642 |
| 3199 | 460.642 |
| 3200 | 459.642 |
| 3201 | 458.642 |
| 3202 | 457.642 |
| 3203 | 456.642 |
| 3204 | 455.642 |
| 3205 | 454.642 |
| 3206 | 453.642 |
| 3207 | 452.642 |
| 3208 | 451.608 |
| 3209 | 463.924 |
| 3210 | 462.89 |
| 3211 | 461.856 |
| 3212 | 460.822 |
| 3213 | 459.822 |
| 3214 | 458.822 |
| 3215 | 457.822 |
| 3216 | 456.822 |
| 3217 | 455.822 |
| 3218 | 454.822 |
| 3219 | 453.822 |
| 3220 | 452.822 |
| 3221 | 451.822 |
| 3222 | 450.822 |
| 3223 | 449.822 |
| 3224 | 448.822 |
| 3225 | 447.822 |
| 3226 | 446.822 |
| 3227 | 445.822 |
| 3228 | 444.822 |
| 3229 | 443.822 |
| 3230 | 442.822 |
| 3231 | 441.822 |
| 3232 | 440.822 |
| 3233 | 439.808 |
| 3234 | 447.394 |
| 3235 | 446.38 |
| 3236 | 445.366 |
| 3237 | 444.352 |
| 3238 | 449.616 |
| 3239 | 448.61 |
| 3240 | 447.604 |
| 3241 | 446.598 |
| 3242 | 445.592 |
| 3243 | 448.078 |
| 3244 | 447.075 |
| 3245 | 446.072 |
| 3246 | 445.072 |
| 3247 | 444.072 |
| 3248 | 448.765 |
| 3249 | 447.748 |
| 3250 | 446.732 |
| 3251 | 445.732 |
| 3252 | 444.732 |
| 3253 | 443.732 |
| 3254 | 442.732 |
| 3255 | 441.732 |
| 3256 | 440.732 |
| 3257 | 439.732 |
| 3258 | 438.732 |
| 3259 | 437.732 |
| 3260 | 436.732 |
| 3261 | 435.732 |
| 3262 | 434.732 |
| 3263 | 433.732 |
| 3264 | 432.732 |
| 3265 | 431.732 |
| 3266 | 430.707 |
| 3267 | 429.682 |
| 3268 | 437.767 |
| 3269 | 436.742 |
| 3270 | 435.742 |
| 3271 | 434.742 |
| 3272 | 433.742 |
| 3273 | 432.742 |
| 3274 | 431.742 |
| 3275 | 430.742 |
| 3276 | 429.742 |
| 3277 | 428.742 |
| 3278 | 439.206 |
| 3279 | 438.18 |
| 3280 | 437.154 |
| 3281 | 436.128 |
| 3282 | 435.102 |
| 3283 | 434.102 |
| 3284 | 433.102 |
| 3285 | 432.102 |
| 3286 | 431.102 |
| 3287 | 430.102 |
| 3288 | 429.102 |
| 3289 | 428.102 |
| 3290 | 427.102 |
| 3291 | 426.102 |
| 3292 | 425.102 |
| 3293 | 437.998 |
| 3294 | 436.925 |
| 3295 | 435.852 |
| 3296 | 434.852 |
| 3297 | 433.852 |
| 3298 | 432.852 |
| 3299 | 431.852 |
| 3300 | 430.852 |
| 3301 | 429.852 |
| 3302 | 428.852 |
| 3303 | 427.852 |
| 3304 | 426.852 |
| 3305 | 425.852 |
| 3306 | 424.852 |
| 3307 | 423.852 |
| 3308 | 422.852 |
| 3309 | 421.852 |
| 3310 | 420.852 |
| 3311 | 419.852 |
| 3312 | 418.802 |
| 3313 | 417.752 |
| 3314 | 430.702 |
| 3315 | 429.652 |
| 3316 | 428.652 |
| 3317 | 427.652 |
| 3318 | 426.652 |
| 3319 | 425.652 |
| 3320 | 424.652 |
| 3321 | 423.652 |
| 3322 | 422.652 |
| 3323 | 421.652 |
| 3324 | 420.652 |
| 3325 | 427.542 |
| 3326 | 426.522 |
| 3327 | 425.502 |
| 3328 | 424.482 |
| 3329 | 423.464 |
| 3330 | 430.047 |
| 3331 | 429.029 |
| 3332 | 428.012 |
| 3333 | 426.978 |
| 3334 | 425.944 |
| 3335 | 424.91 |
| 3336 | 437.596 |
| 3337 | 436.562 |
| 3338 | 435.544 |
| 3339 | 444.126 |
| 3340 | 443.108 |
| 3341 | 442.09 |
| 3342 | 441.072 |
| 3343 | 440.072 |
| 3344 | 439.072 |
| 3345 | 438.018 |
| 3346 | 447.965 |
| 3347 | 446.912 |
| 3348 | 445.912 |
| 3349 | 444.912 |
| 3350 | 443.912 |
| 3351 | 442.912 |
| 3352 | 441.912 |
| 3353 | 440.912 |
| 3354 | 439.912 |
| 3355 | 438.912 |
| 3356 | 437.912 |
| 3357 | 436.912 |
| 3358 | 435.912 |
| 3359 | 434.912 |
| 3360 | 433.912 |
| 3361 | 432.912 |
| 3362 | 431.912 |
| 3363 | 430.909 |
| 3364 | 433.907 |
| 3365 | 432.904 |
| 3366 | 431.902 |
| 3367 | 430.902 |
| 3368 | 429.902 |
| 3369 | 428.902 |
| 3370 | 427.902 |
| 3371 | 426.902 |
| 3372 | 425.864 |
| 3373 | 424.826 |
| 3374 | 423.788 |
| 3375 | 437.25 |
| 3376 | 436.212 |
| 3377 | 435.212 |
| 3378 | 434.212 |
| 3379 | 433.212 |
| 3380 | 432.212 |
| 3381 | 431.212 |
| 3382 | 430.152 |
| 3383 | 429.092 |
| 3384 | 428.032 |
| 3385 | 442.972 |
| 3386 | 441.972 |
| 3387 | 440.972 |
| 3388 | 439.972 |
| 3389 | 438.972 |
| 3390 | 437.972 |
| 3391 | 436.972 |
| 3392 | 435.972 |
| 3393 | 434.972 |
| 3394 | 433.972 |
| 3395 | 432.972 |
| 3396 | 431.972 |
| 3397 | 430.972 |
| 3398 | 429.972 |
| 3399 | 433.327 |
| 3400 | 432.302 |
| 3401 | 431.302 |
| 3402 | 430.302 |
| 3403 | 429.302 |
| 3404 | 428.302 |
| 3405 | 427.239 |
| 3406 | 426.177 |
| 3407 | 425.114 |
| 3408 | 440.552 |
| 3409 | 439.552 |
| 3410 | 438.552 |
| 3411 | 437.552 |
| 3412 | 436.552 |
| 3413 | 435.552 |
| 3414 | 434.552 |
| 3415 | 433.552 |
| 3416 | 432.552 |
| 3417 | 431.552 |
| 3418 | 430.552 |
| 3419 | 429.552 |
| 3420 | 428.552 |
| 3421 | 427.552 |
| 3422 | 433.717 |
| 3423 | 432.702 |
| 3424 | 431.687 |
| 3425 | 430.672 |
| 3426 | 429.609 |
| 3427 | 428.547 |
| 3428 | 427.484 |
| 3429 | 442.922 |
| 3430 | 441.922 |
| 3431 | 440.922 |
| 3432 | 439.922 |
| 3433 | 438.922 |
| 3434 | 437.922 |
| 3435 | 436.922 |
| 3436 | 435.922 |
| 3437 | 434.922 |
| 3438 | 433.922 |
| 3439 | 432.922 |
| 3440 | 431.922 |
| 3441 | 430.922 |
| 3442 | 429.922 |
| 3443 | 428.922 |
| 3444 | 427.922 |
| 3445 | 426.922 |
| 3446 | 425.922 |
| 3447 | 424.922 |
| 3448 | 423.922 |
| 3449 | 428.918 |
| 3450 | 427.914 |
| 3451 | 426.91 |
| 3452 | 425.906 |
| 3453 | 424.902 |
| 3454 | 423.902 |
| 3455 | 422.902 |
| 3456 | 421.902 |
| 3457 | 420.902 |
| 3458 | 419.902 |
| 3459 | 418.902 |
| 3460 | 417.902 |
| 3461 | 416.902 |
| 3462 | 415.902 |
| 3463 | 414.902 |
| 3464 | 413.902 |
| 3465 | 412.902 |
| 3466 | 411.902 |
| 3467 | 410.902 |
| 3468 | 409.902 |
| 3469 | 408.902 |
| 3470 | 407.902 |
| 3471 | 406.902 |
| 3472 | 405.902 |
| 3473 | 404.902 |
| 3474 | 403.902 |
| 3475 | 402.902 |
| 3476 | 401.902 |
| 3477 | 400.902 |
| 3478 | 399.902 |
| 3479 | 398.902 |
| 3480 | 397.902 |
| 3481 | 396.902 |
| 3482 | 395.902 |
| 3483 | 394.902 |
| 3484 | 393.902 |
| 3485 | 392.902 |
| 3486 | 391.902 |
| 3487 | 390.902 |
| 3488 | 389.902 |
| 3489 | 388.902 |
| 3490 | 387.902 |
| 3491 | 386.902 |
| 3492 | 385.902 |
| 3493 | 384.902 |
| 3494 | 383.902 |
| 3495 | 382.902 |
| 3496 | 381.902 |
| 3497 | 380.902 |
| 3498 | 379.902 |
| 3499 | 378.902 |
| 3500 | 377.902 |
| 3501 | 376.902 |
| 3502 | 375.902 |
| 3503 | 374.902 |
| 3504 | 373.902 |
| 3505 | 372.902 |
| 3506 | 371.874 |
| 3507 | 370.846 |
| 3508 | 381.818 |
| 3509 | 380.79 |
| 3510 | 379.762 |
| 3511 | 378.762 |
| 3512 | 377.762 |
| 3513 | 376.762 |
| 3514 | 375.762 |
| 3515 | 374.577 |
| 3516 | 393.702 |
| 3517 | 392.702 |
| 3518 | 391.702 |
| 3519 | 390.702 |
| 3520 | 389.702 |
| 3521 | 388.702 |
| 3522 | 393.194 |
| 3523 | 392.187 |
| 3524 | 391.179 |
| 3525 | 390.172 |
| 3526 | 389.172 |
| 3527 | 388.172 |
| 3528 | 387.172 |
| 3529 | 386.172 |
| 3530 | 385.172 |
| 3531 | 384.172 |
| 3532 | 383.172 |
| 3533 | 382.172 |
| 3534 | 381.172 |
| 3535 | 380.172 |
| 3536 | 385.362 |
| 3537 | 384.352 |
| 3538 | 383.342 |
| 3539 | 382.332 |
| 3540 | 386.102 |
| 3541 | 385.072 |
| 3542 | 384.072 |
| 3543 | 383.072 |
| 3544 | 382.072 |
| 3545 | 381.072 |
| 3546 | 380.072 |
| 3547 | 379.072 |
| 3548 | 378.072 |
| 3549 | 377.072 |
| 3550 | 376.072 |
| 3551 | 375.072 |
| 3552 | 374.072 |
| 3553 | 373.072 |
| 3554 | 372.072 |
| 3555 | 371.072 |
| 3556 | 370.072 |
| 3557 | 369.072 |
| 3558 | 374.782 |
| 3559 | 373.732 |
| 3560 | 378.434 |
| 3561 | 377.427 |
| 3562 | 376.419 |
| 3563 | 375.412 |
| 3564 | 374.412 |
| 3565 | 373.412 |
| 3566 | 372.412 |
| 3567 | 371.327 |
| 3568 | 380.742 |
| 3569 | 379.742 |
| 3570 | 378.742 |
| 3571 | 377.742 |
| 3572 | 376.742 |
| 3573 | 375.742 |
| 3574 | 374.742 |
| 3575 | 373.742 |
| 3576 | 372.742 |
| 3577 | 371.742 |
| 3578 | 370.742 |
| 3579 | 369.742 |
| 3580 | 368.742 |
| 3581 | 367.742 |
| 3582 | 366.742 |
| 3583 | 365.742 |
| 3584 | 364.657 |
| 3585 | 363.572 |
| 3586 | 362.487 |
| 3587 | 382.402 |
| 3588 | 381.402 |
| 3589 | 380.402 |
| 3590 | 379.356 |
| 3591 | 378.31 |
| 3592 | 377.264 |
| 3593 | 392.488 |
| 3594 | 391.442 |
| 3595 | 403.872 |
| 3596 | 402.802 |
| 3597 | 401.732 |
| 3598 | 400.732 |
| 3599 | 399.732 |
| 3600 | 398.732 |
| 3601 | 397.732 |
| 3602 | 396.732 |
| 3603 | 401.244 |
| 3604 | 400.237 |
| 3605 | 399.229 |
| 3606 | 398.222 |
| 3607 | 397.152 |
| 3608 | 396.082 |
| 3609 | 395.012 |
| 3610 | 416.622 |
| 3611 | 415.552 |
| 3612 | 414.448 |
| 3613 | 413.345 |
| 3614 | 430.712 |
| 3615 | 437.492 |
| 3616 | 436.472 |
| 3617 | 435.452 |
| 3618 | 434.432 |
| 3619 | 433.358 |
| 3620 | 432.285 |
| 3621 | 445.212 |
| 3622 | 444.212 |
| 3623 | 443.212 |
| 3624 | 442.212 |
| 3625 | 441.212 |
| 3626 | 440.022 |
| 3627 | 459.782 |
| 3628 | 458.782 |
| 3629 | 457.782 |
| 3630 | 456.782 |
| 3631 | 466.297 |
| 3632 | 465.212 |
| 3633 | 464.212 |
| 3634 | 463.212 |
| 3635 | 462.212 |
| 3636 | 461.212 |
| 3637 | 460.092 |
| 3638 | 473.032 |
| 3639 | 477.872 |
| 3640 | 476.852 |
| 3641 | 475.832 |
| 3642 | 474.797 |
| 3643 | 473.762 |
| 3644 | 483.967 |
| 3645 | 482.932 |
| 3646 | 481.932 |
| 3647 | 480.932 |
| 3648 | 479.932 |
| 3649 | 478.932 |
| 3650 | 477.932 |
| 3651 | 476.737 |
| 3652 | 497.182 |
| 3653 | 496.182 |
| 3654 | 495.182 |
| 3655 | 494.182 |
| 3656 | 493.182 |
| 3657 | 492.182 |
| 3658 | 491.182 |
| 3659 | 490.182 |
| 3660 | 489.182 |
| 3661 | 488.182 |
| 3662 | 487.182 |
| 3663 | 486.182 |
| 3664 | 485.127 |
| 3665 | 491.512 |
| 3666 | 490.512 |
| 3667 | 489.512 |
| 3668 | 488.512 |
| 3669 | 487.512 |
| 3670 | 486.512 |
| 3671 | 485.512 |
| 3672 | 484.512 |
| 3673 | 483.512 |
| 3674 | 482.512 |
| 3675 | 481.512 |
| 3676 | 480.512 |
| 3677 | 479.512 |
| 3678 | 478.512 |
| 3679 | 477.512 |
| 3680 | 476.512 |
| 3681 | 475.512 |
| 3682 | 474.512 |
| 3683 | 473.512 |
| 3684 | 472.512 |
| 3685 | 471.512 |
| 3686 | 470.512 |
| 3687 | 469.512 |
| 3688 | 468.512 |
| 3689 | 467.512 |
| 3690 | 466.512 |
| 3691 | 465.512 |
| 3692 | 464.512 |
| 3693 | 463.512 |
| 3694 | 462.512 |
| 3695 | 461.232 |
| 3696 | 489.952 |
| 3697 | 496.312 |
| 3698 | 495.282 |
| 3699 | 494.252 |
| 3700 | 493.252 |
| 3701 | 492.252 |
| 3702 | 491.252 |
| 3703 | 490.252 |
| 3704 | 489.252 |
| 3705 | 488.252 |
| 3706 | 487.252 |
| 3707 | 486.252 |
| 3708 | 485.252 |
| 3709 | 484.252 |
| 3710 | 483.252 |
| 3711 | 482.252 |
| 3712 | 481.252 |
| 3713 | 480.252 |
| 3714 | 478.972 |
| 3715 | 477.692 |
| 3716 | 521.352 |
| 3717 | 520.352 |
| 3718 | 519.352 |
| 3719 | 518.352 |
| 3720 | 517.352 |
| 3721 | 516.352 |
| 3722 | 515.352 |
| 3723 | 514.352 |
| 3724 | 513.352 |
| 3725 | 512.352 |
| 3726 | 511.352 |
| 3727 | 510.352 |
| 3728 | 509.352 |
| 3729 | 508.352 |
| 3730 | 507.352 |
| 3731 | 506.352 |
| 3732 | 505.346 |
| 3733 | 511.04 |
| 3734 | 510.034 |
| 3735 | 509.028 |
| 3736 | 508.022 |
| 3737 | 506.962 |
| 3738 | 505.902 |
| 3739 | 516.842 |
| 3740 | 515.842 |
| 3741 | 514.842 |
| 3742 | 513.842 |
| 3743 | 512.842 |
| 3744 | 511.842 |
| 3745 | 510.842 |
| 3746 | 509.842 |
| 3747 | 508.842 |
| 3748 | 507.842 |
| 3749 | 506.842 |
| 3750 | 505.842 |
| 3751 | 504.842 |
| 3752 | 503.842 |
| 3753 | 502.842 |
| 3754 | 501.842 |
| 3755 | 500.842 |
| 3756 | 499.842 |
| 3757 | 498.842 |
| 3758 | 497.842 |
| 3759 | 496.842 |
| 3760 | 495.842 |
| 3761 | 494.842 |
| 3762 | 493.842 |
| 3763 | 492.842 |
| 3764 | 491.842 |
| 3765 | 490.842 |
| 3766 | 489.842 |
| 3767 | 488.842 |
| 3768 | 487.842 |
| 3769 | 486.842 |
| 3770 | 485.808 |
| 3771 | 492.835 |
| 3772 | 491.802 |
| 3773 | 490.802 |
| 3774 | 489.802 |
| 3775 | 488.747 |
| 3776 | 495.252 |
| 3777 | 494.199 |
| 3778 | 507.647 |
| 3779 | 506.594 |
| 3780 | 505.542 |
| 3781 | 504.542 |
| 3782 | 503.542 |
| 3783 | 502.542 |
| 3784 | 501.542 |
| 3785 | 500.502 |
| 3786 | 505.462 |
| 3787 | 508.077 |
| 3788 | 507.077 |
| 3789 | 506.077 |
| 3790 | 505.077 |
| 3791 | 504.077 |
| 3792 | 503.077 |
| 3793 | 502.077 |
| 3794 | 501.077 |
| 3795 | 500.053 |
| 3796 | 505.73 |
| 3797 | 504.707 |
| 3798 | 503.707 |
| 3799 | 502.707 |
| 3800 | 501.707 |
| 3801 | 500.707 |
| 3802 | 507.847 |
| 3803 | 506.787 |
| 3804 | 513.357 |
| 3805 | 512.327 |
| 3806 | 511.297 |
| 3807 | 510.297 |
| 3808 | 509.297 |
| 3809 | 508.297 |
| 3810 | 507.297 |
| 3811 | 506.297 |
| 3812 | 505.297 |
| 3813 | 504.297 |
| 3814 | 503.297 |
| 3815 | 502.297 |
| 3816 | 501.297 |
| 3817 | 500.297 |
| 3818 | 499.297 |
| 3819 | 498.297 |
| 3820 | 497.297 |
| 3821 | 496.297 |
| 3822 | 495.297 |
| 3823 | 494.297 |
| 3824 | 493.297 |
| 3825 | 492.297 |
| 3826 | 491.297 |
| 3827 | 490.297 |
| 3828 | 489.297 |
| 3829 | 488.297 |
| 3830 | 487.297 |
| 3831 | 486.297 |
| 3832 | 485.297 |
| 3833 | 484.297 |
| 3834 | 483.297 |
| 3835 | 482.297 |
| 3836 | 481.271 |
| 3837 | 491.745 |
| 3838 | 490.719 |
| 3839 | 489.693 |
| 3840 | 488.667 |
| 3841 | 487.667 |
| 3842 | 486.667 |
| 3843 | 485.667 |
| 3844 | 484.667 |
| 3845 | 483.667 |
| 3846 | 482.667 |
| 3847 | 481.667 |
| 3848 | 480.667 |
| 3849 | 479.667 |
| 3850 | 478.667 |
| 3851 | 477.667 |
| 3852 | 476.667 |
| 3853 | 475.667 |
| 3854 | 474.667 |
| 3855 | 473.667 |
| 3856 | 472.667 |
| 3857 | 471.667 |
| 3858 | 470.667 |
| 3859 | 469.667 |
| 3860 | 468.667 |
| 3861 | 467.667 |
| 3862 | 466.667 |
| 3863 | 465.667 |
| 3864 | 464.617 |
| 3865 | 470.567 |
| 3866 | 469.567 |
| 3867 | 468.567 |
| 3868 | 467.499 |
| 3869 | 466.432 |
| 3870 | 482.964 |
| 3871 | 481.897 |
| 3872 | 480.897 |
| 3873 | 479.897 |
| 3874 | 478.897 |
| 3875 | 477.897 |
| 3876 | 476.897 |
| 3877 | 475.897 |
| 3878 | 474.897 |
| 3879 | 473.897 |
| 3880 | 472.897 |
| 3881 | 471.897 |
| 3882 | 470.897 |
| 3883 | 469.897 |
| 3884 | 468.897 |
| 3885 | 467.897 |
| 3886 | 466.897 |
| 3887 | 465.897 |
| 3888 | 464.897 |
| 3889 | 463.897 |
| 3890 | 462.897 |
| 3891 | 461.877 |
| 3892 | 468.637 |
| 3893 | 467.617 |
| 3894 | 466.597 |
| 3895 | 465.597 |
| 3896 | 464.597 |
| 3897 | 463.597 |
| 3898 | 462.597 |
| 3899 | 461.597 |
| 3900 | 460.597 |
| 3901 | 459.597 |
| 3902 | 458.597 |
| 3903 | 457.597 |
| 3904 | 461.277 |
| 3905 | 460.267 |
| 3906 | 459.257 |
| 3907 | 458.173 |
| 3908 | 472.59 |
| 3909 | 471.507 |
| 3910 | 470.507 |
| 3911 | 469.507 |
| 3912 | 468.507 |
| 3913 | 467.507 |
| 3914 | 466.507 |
| 3915 | 465.507 |
| 3916 | 464.507 |
| 3917 | 463.507 |
| 3918 | 462.507 |
| 3919 | 461.507 |
| 3920 | 460.507 |
| 3921 | 459.507 |
| 3922 | 458.507 |
| 3923 | 457.507 |
| 3924 | 456.507 |
| 3925 | 455.507 |
| 3926 | 454.507 |
| 3927 | 453.507 |
| 3928 | 452.507 |
| 3929 | 451.507 |
| 3930 | 450.507 |
| 3931 | 449.507 |
| 3932 | 448.507 |
| 3933 | 447.507 |
| 3934 | 446.507 |
| 3935 | 445.507 |
| 3936 | 444.507 |
| 3937 | 443.507 |
| 3938 | 442.507 |
| 3939 | 441.507 |
| 3940 | 440.507 |
| 3941 | 439.507 |
| 3942 | 438.507 |
| 3943 | 443.894 |
| 3944 | 442.882 |
| 3945 | 441.869 |
| 3946 | 440.857 |
| 3947 | 439.857 |
| 3948 | 438.857 |
| 3949 | 437.857 |
| 3950 | 436.857 |
| 3951 | 435.857 |
| 3952 | 434.857 |
| 3953 | 433.857 |
| 3954 | 436.502 |
| 3955 | 435.487 |
| 3956 | 434.487 |
| 3957 | 433.487 |
| 3958 | 432.487 |
| 3959 | 431.487 |
| 3960 | 430.287 |
| 3961 | 451.087 |
| 3962 | 450.087 |
| 3963 | 449.087 |
| 3964 | 448.087 |
| 3965 | 447.087 |
| 3966 | 446.087 |
| 3967 | 445.087 |
| 3968 | 444.087 |
| 3969 | 443.087 |
| 3970 | 442.087 |
| 3971 | 441.007 |
| 3972 | 439.927 |
| 3973 | 454.027 |
| 3974 | 453.027 |
| 3975 | 452.027 |
| 3976 | 451.027 |
| 3977 | 450.027 |
| 3978 | 449.027 |
| 3979 | 448.027 |
| 3980 | 447.027 |
| 3981 | 446.027 |
| 3982 | 445.027 |
| 3983 | 444.027 |
| 3984 | 443.027 |
| 3985 | 442.027 |
| 3986 | 441.027 |
| 3987 | 440.027 |
| 3988 | 439.027 |
| 3989 | 438.027 |
| 3990 | 437.027 |
| 3991 | 436.027 |
| 3992 | 435.027 |
| 3993 | 434.027 |
| 3994 | 433.027 |
| 3995 | 432.027 |
| 3996 | 431.027 |
| 3997 | 430.027 |
| 3998 | 429.027 |
| 3999 | 428.027 |
| 4000 | 427.027 |
| 4001 | 426.027 |
| 4002 | 425.027 |
| 4003 | 424.027 |
| 4004 | 423.027 |
| 4005 | 422.027 |
| 4006 | 421.027 |
| 4007 | 420.027 |
| 4008 | 418.95 |
| 4009 | 432.373 |
| 4010 | 431.297 |
| 4011 | 430.297 |
| 4012 | 429.297 |
| 4013 | 428.297 |
| 4014 | 427.297 |
| 4015 | 426.297 |
| 4016 | 425.297 |
| 4017 | 424.297 |
| 4018 | 423.297 |
| 4019 | 422.297 |
| 4020 | 421.297 |
| 4021 | 420.297 |
| 4022 | 419.297 |
| 4023 | 418.297 |
| 4024 | 417.297 |
| 4025 | 416.297 |
| 4026 | 415.297 |
| 4027 | 414.297 |
| 4028 | 413.297 |
| 4029 | 412.297 |
| 4030 | 411.297 |
| 4031 | 410.297 |
| 4032 | 409.297 |
| 4033 | 429.237 |
| 4034 | 428.047 |
| 4035 | 427.047 |
| 4036 | 426.047 |
| 4037 | 425.047 |
| 4038 | 424.047 |
| 4039 | 423.047 |
| 4040 | 422.047 |
| 4041 | 421.047 |
| 4042 | 420.047 |
| 4043 | 419.047 |
| 4044 | 418.047 |
| 4045 | 417.047 |
| 4046 | 416.047 |
| 4047 | 415.047 |
| 4048 | 414.047 |
| 4049 | 413.047 |
| 4050 | 412.047 |
| 4051 | 411.047 |
| 4052 | 410.047 |
| 4053 | 409.047 |
| 4054 | 408.047 |
| 4055 | 407.047 |
| 4056 | 406.047 |
| 4057 | 405.047 |
| 4058 | 404.047 |
| 4059 | 403.047 |
| 4060 | 402.047 |
| 4061 | 401.047 |
| 4062 | 400.047 |
| 4063 | 399.047 |
| 4064 | 398.047 |
| 4065 | 397.047 |
| 4066 | 396.047 |
| 4067 | 395.047 |
| 4068 | 394.047 |
| 4069 | 393.047 |
| 4070 | 392.047 |
| 4071 | 391.047 |
| 4072 | 390.047 |
| 4073 | 389.047 |
| 4074 | 388.047 |
| 4075 | 387.047 |
| 4076 | 386.047 |
| 4077 | 385.047 |
| 4078 | 384.047 |
| 4079 | 383.047 |
| 4080 | 382.047 |
| 4081 | 381.047 |
| 4082 | 379.952 |
| 4083 | 390.547 |
| 4084 | 395.397 |
| 4085 | 394.357 |
| 4086 | 393.357 |
| 4087 | 392.357 |
| 4088 | 391.357 |
| 4089 | 390.357 |
| 4090 | 394.562 |
| 4091 | 393.557 |
| 4092 | 392.552 |
| 4093 | 391.547 |
| 4094 | 390.523 |
| 4095 | 395.99 |
| 4096 | 394.967 |
| 4097 | 393.967 |
| 4098 | 392.967 |
| 4099 | 391.967 |
| 4100 | 390.967 |
| 4101 | 389.967 |
| 4102 | 394.947 |
| 4103 | 393.927 |
| 4104 | 392.907 |
| 4105 | 391.907 |
| 4106 | 390.907 |
| 4107 | 389.907 |
| 4108 | 388.907 |
| 4109 | 387.907 |
| 4110 | 386.907 |
| 4111 | 385.907 |
| 4112 | 384.907 |
| 4113 | 383.907 |
| 4114 | 382.907 |
| 4115 | 381.907 |
| 4116 | 380.907 |
| 4117 | 379.907 |
| 4118 | 378.907 |
| 4119 | 377.907 |
| 4120 | 376.907 |
| 4121 | 375.907 |
| 4122 | 374.907 |
| 4123 | 373.907 |
| 4124 | 372.907 |
| 4125 | 371.907 |
| 4126 | 370.907 |
| 4127 | 369.837 |
| 4128 | 382.267 |
| 4129 | 381.197 |
| 4130 | 380.197 |
| 4131 | 379.197 |
| 4132 | 378.197 |
| 4133 | 377.197 |
| 4134 | 376.197 |
| 4135 | 375.197 |
| 4136 | 374.197 |
| 4137 | 373.197 |
| 4138 | 372.197 |
| 4139 | 371.197 |
| 4140 | 370.197 |
| 4141 | 369.197 |
| 4142 | 368.197 |
| 4143 | 367.197 |
| 4144 | 366.197 |
| 4145 | 365.197 |
| 4146 | 364.197 |
| 4147 | 363.197 |
| 4148 | 362.197 |
| 4149 | 361.197 |
| 4150 | 360.197 |
| 4151 | 359.197 |
| 4152 | 358.197 |
| 4153 | 357.197 |
| 4154 | 356.197 |
| 4155 | 355.197 |
| 4156 | 354.197 |
| 4157 | 353.197 |
| 4158 | 352.197 |
| 4159 | 351.197 |
| 4160 | 350.197 |
| 4161 | 349.197 |
| 4162 | 348.197 |
| 4163 | 347.197 |
| 4164 | 346.197 |
| 4165 | 345.197 |
| 4166 | 344.197 |
| 4167 | 343.197 |
| 4168 | 342.197 |
| 4169 | 341.197 |
| 4170 | 340.197 |
| 4171 | 339.197 |
| 4172 | 338.197 |
| 4173 | 337.197 |
| 4174 | 336.197 |
| 4175 | 335.197 |
| 4176 | 334.197 |
| 4177 | 333.197 |
| 4178 | 332.197 |
| 4179 | 331.099 |
| 4180 | 330.002 |
| 4181 | 352.184 |
| 4182 | 351.087 |
| 4183 | 350.087 |
| 4184 | 349.087 |
| 4185 | 348.087 |
| 4186 | 347.087 |
| 4187 | 346.087 |
| 4188 | 345.087 |
| 4189 | 344.087 |
| 4190 | 343.087 |
| 4191 | 342.087 |
| 4192 | 341.087 |
| 4193 | 340.087 |
| 4194 | 339.087 |
| 4195 | 338.087 |
| 4196 | 337.087 |
| 4197 | 336.087 |
| 4198 | 335.087 |
| 4199 | 334.087 |
| 4200 | 333.087 |
| 4201 | 332.069 |
| 4202 | 338.452 |
| 4203 | 337.434 |
| 4204 | 336.417 |
| 4205 | 335.417 |
| 4206 | 334.417 |
| 4207 | 333.417 |
| 4208 | 332.417 |
| 4209 | 355.317 |
| 4210 | 354.217 |
| 4211 | 353.117 |
| 4212 | 352.017 |
| 4213 | 350.987 |
| 4214 | 359.957 |
| 4215 | 358.927 |
| 4216 | 357.897 |
| 4217 | 361.494 |
| 4218 | 360.492 |
| 4219 | 359.489 |
| 4220 | 358.487 |
| 4221 | 357.487 |
| 4222 | 356.487 |
| 4223 | 355.487 |
| 4224 | 354.487 |
| 4225 | 353.487 |
| 4226 | 352.487 |
| 4227 | 351.487 |
| 4228 | 350.487 |
| 4229 | 349.487 |
| 4230 | 348.487 |
| 4231 | 347.487 |
| 4232 | 346.487 |
| 4233 | 345.487 |
| 4234 | 344.487 |
| 4235 | 343.487 |
| 4236 | 342.434 |
| 4237 | 341.382 |
| 4238 | 340.329 |
| 4239 | 353.917 |
| 4240 | 359.474 |
| 4241 | 358.462 |
| 4242 | 357.449 |
| 4243 | 356.437 |
| 4244 | 355.437 |
| 4245 | 354.437 |
| 4246 | 353.437 |
| 4247 | 352.437 |
| 4248 | 351.437 |
| 4249 | 350.437 |
| 4250 | 349.437 |
| 4251 | 348.437 |
| 4252 | 347.437 |
| 4253 | 346.437 |
| 4254 | 345.437 |
| 4255 | 344.437 |
| 4256 | 343.437 |
| 4257 | 342.437 |
| 4258 | 341.437 |
| 4259 | 349.762 |
| 4260 | 348.687 |
| 4261 | 347.687 |
| 4262 | 346.687 |
| 4263 | 350.107 |
| 4264 | 349.097 |
| 4265 | 348.087 |
| 4266 | 347.087 |
| 4267 | 346.087 |
| 4268 | 345.087 |
| 4269 | 344.087 |
| 4270 | 343.087 |
| 4271 | 342.043 |
| 4272 | 350.48 |
| 4273 | 349.437 |
| 4274 | 348.437 |
| 4275 | 347.437 |
| 4276 | 346.437 |
| 4277 | 345.437 |
| 4278 | 344.437 |
| 4279 | 343.437 |
| 4280 | 342.437 |
| 4281 | 341.437 |
| 4282 | 340.437 |
| 4283 | 339.437 |
| 4284 | 338.437 |
| 4285 | 337.437 |
| 4286 | 336.437 |
| 4287 | 335.437 |
| 4288 | 334.437 |
| 4289 | 333.437 |
| 4290 | 332.437 |
| 4291 | 331.437 |
| 4292 | 330.437 |
| 4293 | 329.437 |
| 4294 | 328.352 |
| 4295 | 337.767 |
| 4296 | 336.703 |
| 4297 | 335.64 |
| 4298 | 346.107 |
| 4299 | 345.107 |
| 4300 | 344.107 |
| 4301 | 343.107 |
| 4302 | 342.107 |
| 4303 | 341.107 |
| 4304 | 340.107 |
| 4305 | 339.107 |
| 4306 | 338.107 |
| 4307 | 337.107 |
| 4308 | 343.08 |
| 4309 | 342.053 |
| 4310 | 341.027 |
| 4311 | 339.943 |
| 4312 | 338.86 |
| 4313 | 353.317 |
| 4314 | 352.317 |
| 4315 | 351.317 |
| 4316 | 350.317 |
| 4317 | 349.317 |
| 4318 | 348.317 |
| 4319 | 347.317 |
| 4320 | 352.327 |
| 4321 | 351.317 |
| 4322 | 350.307 |
| 4323 | 349.297 |
| 4324 | 348.297 |
| 4325 | 347.297 |
| 4326 | 346.297 |
| 4327 | 345.297 |
| 4328 | 344.297 |
| 4329 | 343.297 |
| 4330 | 342.297 |
| 4331 | 341.247 |
| 4332 | 340.197 |
| 4333 | 352.907 |
| 4334 | 351.857 |
| 4335 | 350.827 |
| 4336 | 359.627 |
| 4337 | 358.597 |
| 4338 | 357.567 |
| 4339 | 356.532 |
| 4340 | 355.497 |
| 4341 | 365.462 |
| 4342 | 364.427 |
| 4343 | 363.427 |
| 4344 | 362.427 |
| 4345 | 361.427 |
| 4346 | 360.427 |
| 4347 | 359.379 |
| 4348 | 371.832 |
| 4349 | 370.784 |
| 4350 | 369.737 |
| 4351 | 383.682 |
| 4352 | 382.627 |
| 4353 | 381.572 |
| 4354 | 380.517 |
| 4355 | 379.517 |
| 4356 | 378.517 |
| 4357 | 377.517 |
| 4358 | 376.517 |
| 4359 | 375.517 |
| 4360 | 374.517 |
| 4361 | 373.517 |
| 4362 | 372.517 |
| 4363 | 371.517 |
| 4364 | 370.517 |
| 4365 | 369.517 |
| 4366 | 368.517 |
| 4367 | 367.517 |
| 4368 | 370.51 |
| 4369 | 369.503 |
| 4370 | 368.497 |
| 4371 | 372.759 |
| 4372 | 371.752 |
| 4373 | 370.744 |
| 4374 | 369.737 |
| 4375 | 368.737 |
| 4376 | 367.737 |
| 4377 | 366.737 |
| 4378 | 365.737 |
| 4379 | 364.737 |
| 4380 | 363.737 |
| 4381 | 379.672 |
| 4382 | 378.607 |
| 4383 | 377.542 |
| 4384 | 376.477 |
| 4385 | 375.477 |
| 4386 | 374.477 |
| 4387 | 373.477 |
| 4388 | 372.477 |
| 4389 | 371.477 |
| 4390 | 370.477 |
| 4391 | 369.477 |
| 4392 | 368.477 |
| 4393 | 367.477 |
| 4394 | 372.407 |
| 4395 | 371.367 |
| 4396 | 370.257 |
| 4397 | 369.147 |
| 4398 | 387.537 |
| 4399 | 386.537 |
| 4400 | 385.537 |
| 4401 | 389.432 |
| 4402 | 388.427 |
| 4403 | 387.422 |
| 4404 | 386.417 |
| 4405 | 385.417 |
| 4406 | 384.417 |
| 4407 | 383.417 |
| 4408 | 382.417 |
| 4409 | 381.417 |
| 4410 | 380.417 |
| 4411 | 379.417 |
| 4412 | 378.417 |
| 4413 | 377.417 |
| 4414 | 376.417 |
| 4415 | 375.417 |
| 4416 | 374.417 |
| 4417 | 373.417 |
| 4418 | 372.417 |
| 4419 | 371.417 |
| 4420 | 370.417 |
| 4421 | 369.417 |
| 4422 | 368.417 |
| 4423 | 367.417 |
| 4424 | 366.417 |
| 4425 | 365.417 |
| 4426 | 364.417 |
| 4427 | 363.417 |
| 4428 | 362.417 |
| 4429 | 361.417 |
| 4430 | 360.417 |
| 4431 | 359.362 |
| 4432 | 358.307 |
| 4433 | 357.252 |
| 4434 | 371.437 |
| 4435 | 379.793 |
| 4436 | 378.75 |
| 4437 | 377.707 |
| 4438 | 376.707 |
| 4439 | 375.707 |
| 4440 | 374.65 |
| 4441 | 385.293 |
| 4442 | 384.237 |
| 4443 | 383.237 |
| 4444 | 382.237 |
| 4445 | 388.187 |
| 4446 | 387.137 |
| 4447 | 395.252 |
| 4448 | 394.227 |
| 4449 | 393.202 |
| 4450 | 392.177 |
| 4451 | 391.177 |
| 4452 | 390.177 |
| 4453 | 389.177 |
| 4454 | 388.177 |
| 4455 | 387.177 |
| 4456 | 386.177 |
| 4457 | 385.177 |
| 4458 | 384.177 |
| 4459 | 383.177 |
| 4460 | 382.177 |
| 4461 | 381.177 |
| 4462 | 380.177 |
| 4463 | 379.177 |
| 4464 | 378.177 |
| 4465 | 377.177 |
| 4466 | 376.177 |
| 4467 | 375.177 |
| 4468 | 374.177 |
| 4469 | 373.177 |
| 4470 | 372.177 |
| 4471 | 371.177 |
| 4472 | 370.177 |
| 4473 | 369.177 |
| 4474 | 368.177 |
| 4475 | 367.177 |
| 4476 | 366.177 |
| 4477 | 365.177 |
| 4478 | 364.177 |
| 4479 | 363.177 |
| 4480 | 362.177 |
| 4481 | 361.177 |
| 4482 | 360.177 |
| 4483 | 367.343 |
| 4484 | 366.31 |
| 4485 | 365.277 |
| 4486 | 367.522 |
| 4487 | 366.507 |
| 4488 | 365.507 |
| 4489 | 364.507 |
| 4490 | 363.507 |
| 4491 | 362.507 |
| 4492 | 361.487 |
| 4493 | 368.267 |
| 4494 | 367.247 |
| 4495 | 366.227 |
| 4496 | 365.227 |
| 4497 | 364.227 |
| 4498 | 363.227 |
| 4499 | 362.227 |
| 4500 | 361.227 |
| 4501 | 360.227 |
| 4502 | 359.227 |
| 4503 | 358.142 |
| 4504 | 357.057 |
| 4505 | 355.972 |
| 4506 | 375.887 |
| 4507 | 374.887 |
| 4508 | 373.887 |
| 4509 | 372.887 |
| 4510 | 371.887 |
| 4511 | 370.887 |
| 4512 | 369.887 |
| 4513 | 368.887 |
| 4514 | 367.887 |
| 4515 | 366.887 |
| 4516 | 365.887 |
| 4517 | 364.887 |
| 4518 | 363.887 |
| 4519 | 362.887 |
| 4520 | 361.887 |
| 4521 | 360.887 |
| 4522 | 359.887 |
| 4523 | 358.887 |
| 4524 | 357.887 |
| 4525 | 356.887 |
| 4526 | 360.11 |
| 4527 | 359.103 |
| 4528 | 358.097 |
| 4529 | 356.96 |
| 4530 | 355.823 |
| 4531 | 378.327 |
| 4532 | 377.327 |
| 4533 | 376.327 |
| 4534 | 375.327 |
| 4535 | 374.327 |
| 4536 | 373.327 |
| 4537 | 372.327 |
| 4538 | 371.327 |
| 4539 | 370.327 |
| 4540 | 369.327 |
| 4541 | 368.327 |
| 4542 | 367.327 |
| 4543 | 366.327 |
| 4544 | 365.327 |
| 4545 | 364.327 |
| 4546 | 363.327 |
| 4547 | 362.327 |
| 4548 | 361.327 |
| 4549 | 360.327 |
| 4550 | 359.327 |
| 4551 | 358.327 |
| 4552 | 357.304 |
| 4553 | 364.912 |
| 4554 | 363.889 |
| 4555 | 362.867 |
| 4556 | 365.72 |
| 4557 | 364.713 |
| 4558 | 363.707 |
| 4559 | 370.327 |
| 4560 | 369.297 |
| 4561 | 368.267 |
| 4562 | 367.267 |
| 4563 | 366.267 |
| 4564 | 365.267 |
| 4565 | 364.267 |
| 4566 | 363.267 |
| 4567 | 362.267 |
| 4568 | 361.267 |
| 4569 | 366.764 |
| 4570 | 365.752 |
| 4571 | 364.739 |
| 4572 | 363.727 |
| 4573 | 362.727 |
| 4574 | 361.727 |
| 4575 | 360.727 |
| 4576 | 359.727 |
| 4577 | 358.727 |
| 4578 | 357.727 |
| 4579 | 356.727 |
| 4580 | 355.727 |
| 4581 | 354.727 |
| 4582 | 353.709 |
| 4583 | 360.062 |
| 4584 | 359.044 |
| 4585 | 358.027 |
| 4586 | 357.027 |
| 4587 | 356.027 |
| 4588 | 355.027 |
| 4589 | 354.027 |
| 4590 | 353.027 |
| 4591 | 352.027 |
| 4592 | 351.027 |
| 4593 | 350.027 |
| 4594 | 349.027 |
| 4595 | 348.027 |
| 4596 | 347.027 |
| 4597 | 346.027 |
| 4598 | 345.027 |
| 4599 | 344.027 |
| 4600 | 343.027 |
| 4601 | 342.027 |
| 4602 | 341.027 |
| 4603 | 347.837 |
| 4604 | 346.817 |
| 4605 | 345.797 |
| 4606 | 344.777 |
| 4607 | 353.033 |
| 4608 | 351.99 |
| 4609 | 350.947 |
| 4610 | 349.947 |
| 4611 | 348.947 |
| 4612 | 347.947 |
| 4613 | 346.947 |
| 4614 | 345.947 |
| 4615 | 344.947 |
| 4616 | 343.947 |
| 4617 | 342.947 |
| 4618 | 341.947 |
| 4619 | 340.947 |
| 4620 | 339.947 |
| 4621 | 338.947 |
| 4622 | 337.947 |
| 4623 | 336.947 |
| 4624 | 335.947 |
| 4625 | 334.947 |
| 4626 | 337.542 |
| 4627 | 336.527 |
| 4628 | 335.527 |
| 4629 | 334.527 |
| 4630 | 337.487 |
| 4631 | 336.487 |
| 4632 | 335.487 |
| 4633 | 334.487 |
| 4634 | 333.487 |
| 4635 | 337.657 |
| 4636 | 336.657 |
| 4637 | 335.657 |
| 4638 | 334.657 |
| 4639 | 333.657 |
| 4640 | 337.937 |
| 4641 | 336.937 |
| 4642 | 339.487 |
| 4643 | 338.487 |
| 4644 | 341.347 |
| 4645 | 344.177 |
| 4646 | 343.157 |
| 4647 | 342.157 |
| 4648 | 344.947 |
| 4649 | 347.787 |
| 4650 | 350.577 |
| 4651 | 353.407 |
| 4652 | 352.387 |
| 4653 | 351.387 |
| 4654 | 350.387 |
| 4655 | 349.387 |
| 4656 | 348.387 |
| 4657 | 347.387 |
| 4658 | 346.387 |
| 4659 | 345.387 |
| 4660 | 344.387 |
| 4661 | 343.387 |
| 4662 | 342.387 |
| 4663 | 341.387 |
| 4664 | 344.632 |
| 4665 | 343.607 |
| 4666 | 342.607 |
| 4667 | 341.607 |
| 4668 | 340.607 |
| 4669 | 339.607 |
| 4670 | 338.607 |
| 4671 | 337.607 |
| 4672 | 341.587 |
| 4673 | 340.587 |
| 4674 | 339.587 |
| 4675 | 338.587 |
| 4676 | 337.587 |
| 4677 | 336.587 |
| 4678 | 335.587 |
| 4679 | 334.587 |
| 4680 | 333.587 |
| 4681 | 332.587 |
| 4682 | 331.587 |
| 4683 | 330.587 |
| 4684 | 333.817 |
| 4685 | 332.797 |
| 4686 | 335.927 |
| 4687 | 334.927 |
| 4688 | 333.927 |
| 4689 | 337.517 |
| 4690 | 336.517 |
| 4691 | 335.517 |
| 4692 | 334.517 |
| 4693 | 333.517 |
| 4694 | 332.517 |
| 4695 | 331.517 |
| 4696 | 330.517 |
| 4697 | 329.517 |
| 4698 | 328.517 |
| 4699 | 327.517 |
| 4700 | 326.517 |
| 4701 | 325.517 |
| 4702 | 324.517 |
| 4703 | 323.517 |
| 4704 | 322.517 |
| 4705 | 325.232 |
| 4706 | 324.217 |
| 4707 | 323.217 |
| 4708 | 327.417 |
| 4709 | 331.337 |
| 4710 | 330.337 |
| 4711 | 333.417 |
| 4712 | 332.397 |
| 4713 | 331.372 |
| 4714 | 335.037 |
| 4715 | 334.037 |
| 4716 | 336.917 |
| 4717 | 335.897 |
| 4718 | 334.897 |
| 4719 | 333.877 |
| 4720 | 336.957 |
| 4721 | 335.957 |
| 4722 | 334.957 |
| 4723 | 333.957 |
| 4724 | 332.957 |
| 4725 | 331.957 |
| 4726 | 330.957 |
| 4727 | 329.957 |
| 4728 | 328.957 |
| 4729 | 332.137 |
| 4730 | 331.137 |
| 4731 | 330.137 |
| 4732 | 329.137 |
| 4733 | 328.137 |
| 4734 | 327.137 |
| 4735 | 326.137 |
| 4736 | 325.137 |
| 4737 | 324.137 |
| 4738 | 323.137 |
| 4739 | 322.137 |
| 4740 | 327.777 |
| 4741 | 326.777 |
| 4742 | 325.777 |
| 4743 | 324.777 |
| 4744 | 328.067 |
| 4745 | 327.067 |
| 4746 | 326.067 |
| 4747 | 328.277 |
| 4748 | 327.277 |
| 4749 | 329.577 |
| 4750 | 328.577 |
| 4751 | 332.737 |
| 4752 | 331.737 |
| 4753 | 330.737 |
| 4754 | 329.737 |
| 4755 | 332.777 |
| 4756 | 331.777 |
| 4757 | 330.777 |
| 4758 | 329.777 |
| 4759 | 328.777 |
| 4760 | 327.777 |
| 4761 | 326.777 |
| 4762 | 325.777 |
| 4763 | 328.172 |
| 4764 | 327.157 |
| 4765 | 326.157 |
| 4766 | 325.157 |
| 4767 | 324.157 |
| 4768 | 323.157 |
| 4769 | 322.157 |
| 4770 | 321.157 |
| 4771 | 320.157 |
| 4772 | 319.157 |
| 4773 | 318.142 |
| 4774 | 320.587 |
| 4775 | 319.587 |
| 4776 | 318.587 |
| 4777 | 317.587 |
| 4778 | 316.587 |
| 4779 | 315.587 |
| 4780 | 314.587 |
| 4781 | 313.587 |
| 4782 | 312.587 |
| 4783 | 311.587 |
| 4784 | 310.587 |
| 4785 | 309.587 |
| 4786 | 308.587 |
| 4787 | 307.587 |
| 4788 | 306.587 |
| 4789 | 305.587 |
| 4790 | 309.042 |
| 4791 | 308.017 |
| 4792 | 307.002 |
| 4793 | 309.597 |
| 4794 | 313.997 |
| 4795 | 312.997 |
| 4796 | 315.757 |
| 4797 | 314.757 |
| 4798 | 313.757 |
| 4799 | 312.757 |
| 4800 | 311.757 |
| 4801 | 310.757 |
| 4802 | 314.607 |
| 4803 | 313.607 |
| 4804 | 312.607 |
| 4805 | 314.932 |
| 4806 | 313.917 |
| 4807 | 312.917 |
| 4808 | 311.917 |
| 4809 | 310.917 |
| 4810 | 309.917 |
| 4811 | 308.917 |
| 4812 | 307.917 |
| 4813 | 314.387 |
| 4814 | 313.387 |
| 4815 | 312.387 |
| 4816 | 311.387 |
| 4817 | 310.387 |
| 4818 | 313.227 |
| 4819 | 312.227 |
| 4820 | 311.227 |
| 4821 | 314.207 |
| 4822 | 313.187 |
| 4823 | 316.817 |
| 4824 | 315.817 |
| 4825 | 319.067 |
| 4826 | 318.067 |
| 4827 | 317.067 |
| 4828 | 316.067 |
| 4829 | 315.067 |
| 4830 | 314.067 |
| 4831 | 317.837 |
| 4832 | 316.837 |
| 4833 | 321.202 |
| 4834 | 320.167 |
| 4835 | 324.037 |
| 4836 | 329.127 |
| 4837 | 328.127 |
| 4838 | 327.127 |
| 4839 | 332.457 |
| 4840 | 335.437 |
| 4841 | 334.437 |
| 4842 | 337.077 |
| 4843 | 336.077 |
| 4844 | 335.077 |
| 4845 | 334.077 |
| 4846 | 333.077 |
| 4847 | 337.292 |
| 4848 | 336.257 |
| 4849 | 338.927 |
| 4850 | 337.927 |
| 4851 | 336.907 |
| 4852 | 340.067 |
| 4853 | 343.267 |
| 4854 | 342.247 |
| 4855 | 341.247 |
| 4856 | 340.247 |
| 4857 | 342.942 |
| 4858 | 341.927 |
| 4859 | 340.927 |
| 4860 | 339.927 |
| 4861 | 338.927 |
| 4862 | 337.927 |
| 4863 | 336.927 |
| 4864 | 335.927 |
| 4865 | 334.927 |
| 4866 | 333.927 |
| 4867 | 332.927 |
| 4868 | 331.927 |
| 4869 | 330.927 |
| 4870 | 329.927 |
| 4871 | 328.927 |
| 4872 | 327.927 |
| 4873 | 326.927 |
| 4874 | 325.927 |
| 4875 | 324.927 |
| 4876 | 323.927 |
| 4877 | 322.927 |
| 4878 | 321.927 |
| 4879 | 320.927 |
| 4880 | 319.927 |
| 4881 | 322.797 |
| 4882 | 321.797 |
| 4883 | 320.797 |
| 4884 | 319.797 |
| 4885 | 318.797 |
| 4886 | 317.767 |
| 4887 | 321.527 |
| 4888 | 324.667 |
| 4889 | 323.667 |
| 4890 | 322.667 |
| 4891 | 321.667 |
| 4892 | 320.667 |
| 4893 | 319.667 |
| 4894 | 318.667 |
| 4895 | 317.667 |
| 4896 | 316.667 |
| 4897 | 315.642 |
| 4898 | 319.127 |
| 4899 | 318.127 |
| 4900 | 317.127 |
| 4901 | 316.127 |
| 4902 | 315.127 |
| 4903 | 314.127 |
| 4904 | 313.112 |
| 4905 | 315.647 |
| 4906 | 314.647 |
| 4907 | 313.627 |
| 4908 | 316.537 |
| 4909 | 315.512 |
| 4910 | 318.917 |
| 4911 | 317.917 |
| 4912 | 320.657 |
| 4913 | 319.657 |
| 4914 | 318.657 |
| 4915 | 321.117 |
| 4916 | 320.117 |
| 4917 | 319.117 |
| 4918 | 318.117 |
| 4919 | 317.117 |
| 4920 | 316.117 |
| 4921 | 315.117 |
| 4922 | 314.117 |
| 4923 | 313.117 |
| 4924 | 312.117 |
| 4925 | 315.437 |
| 4926 | 314.437 |
| 4927 | 313.437 |
| 4928 | 312.412 |
| 4929 | 315.647 |
| 4930 | 314.647 |
| 4931 | 313.647 |
| 4932 | 312.647 |
| 4933 | 311.647 |
| 4934 | 310.647 |
| 4935 | 309.647 |
| 4936 | 308.647 |
| 4937 | 307.647 |
| 4938 | 306.647 |
| 4939 | 305.647 |
| 4940 | 304.647 |
| 4941 | 308.637 |
| 4942 | 307.637 |
| 4943 | 306.637 |
| 4944 | 309.077 |
| 4945 | 308.077 |
| 4946 | 307.077 |
| 4947 | 306.077 |
| 4948 | 308.592 |
| 4949 | 307.577 |
| 4950 | 306.577 |
| 4951 | 305.577 |
| 4952 | 308.517 |
| 4953 | 307.517 |
| 4954 | 306.517 |
| 4955 | 305.517 |
| 4956 | 309.157 |
| 4957 | 308.157 |
| 4958 | 307.117 |
| 4959 | 312.037 |
| 4960 | 314.917 |
| 4961 | 318.502 |
| 4962 | 317.477 |
| 4963 | 320.657 |
| 4964 | 319.657 |
| 4965 | 318.657 |
| 4966 | 317.657 |
| 4967 | 316.657 |
| 4968 | 315.657 |
| 4969 | 314.657 |
| 4970 | 313.657 |
| 4971 | 312.657 |
| 4972 | 311.657 |
| 4973 | 310.657 |
| 4974 | 309.657 |
| 4975 | 308.657 |
| 4976 | 307.657 |
| 4977 | 311.367 |
| 4978 | 313.767 |
| 4979 | 312.767 |
| 4980 | 311.767 |
| 4981 | 310.747 |
| 4982 | 313.687 |
| 4983 | 312.667 |
| 4984 | 315.547 |
| 4985 | 314.547 |
| 4986 | 313.547 |
| 4987 | 312.547 |
| 4988 | 311.547 |
| 4989 | 310.547 |
| 4990 | 309.547 |
| 4991 | 308.547 |
| 4992 | 307.547 |
| 4993 | 306.547 |
| 4994 | 305.547 |
| 4995 | 304.547 |
| 4996 | 303.547 |
| 4997 | 302.547 |
| 4998 | 301.547 |
| 4999 | 300.547 |
| 5000 | 299.547 |
| 5001 | 298.547 |
| 5002 | 297.547 |
| 5003 | 296.547 |
| 5004 | 295.547 |
| 5005 | 294.547 |
| 5006 | 297.137 |
| 5007 | 296.137 |
| 5008 | 295.137 |
| 5009 | 294.137 |
| 5010 | 293.137 |
| 5011 | 297.157 |
| 5012 | 296.157 |
| 5013 | 295.157 |
| 5014 | 294.157 |
| 5015 | 293.157 |
| 5016 | 292.157 |
| 5017 | 291.157 |
| 5018 | 290.157 |
| 5019 | 289.157 |
| 5020 | 288.157 |
| 5021 | 291.217 |
| 5022 | 295.337 |
| 5023 | 294.337 |
| 5024 | 293.337 |
| 5025 | 296.367 |
| 5026 | 299.987 |
| 5027 | 298.987 |
| 5028 | 297.987 |
| 5029 | 296.987 |
| 5030 | 295.987 |
| 5031 | 294.987 |
| 5032 | 293.987 |
| 5033 | 297.797 |
| 5034 | 296.797 |
| 5035 | 295.797 |
| 5036 | 298.687 |
| 5037 | 297.687 |
| 5038 | 296.687 |
| 5039 | 295.687 |
| 5040 | 294.687 |
| 5041 | 293.687 |
| 5042 | 292.687 |
| 5043 | 291.687 |
| 5044 | 290.687 |
| 5045 | 289.687 |
| 5046 | 292.397 |
| 5047 | 291.397 |
| 5048 | 295.607 |
| 5049 | 297.897 |
| 5050 | 296.897 |
| 5051 | 300.067 |
| 5052 | 299.067 |
| 5053 | 298.067 |
| 5054 | 297.067 |
| 5055 | 300.447 |
| 5056 | 299.447 |
| 5057 | 298.447 |
| 5058 | 301.487 |
| 5059 | 300.487 |
| 5060 | 299.487 |
| 5061 | 303.857 |
| 5062 | 302.857 |
| 5063 | 301.857 |
| 5064 | 300.857 |
| 5065 | 299.857 |
| 5066 | 298.857 |
| 5067 | 303.297 |
| 5068 | 302.297 |
| 5069 | 301.297 |
| 5070 | 300.297 |
| 5071 | 303.437 |
| 5072 | 302.437 |
| 5073 | 301.437 |
| 5074 | 304.487 |
| 5075 | 303.487 |
| 5076 | 307.607 |
| 5077 | 306.607 |
| 5078 | 305.607 |
| 5079 | 304.607 |
| 5080 | 306.917 |
| 5081 | 305.917 |
| 5082 | 304.917 |
| 5083 | 308.707 |
| 5084 | 307.707 |
| 5085 | 310.427 |
| 5086 | 309.427 |
| 5087 | 308.427 |
| 5088 | 307.427 |
| 5089 | 306.427 |
| 5090 | 309.617 |
| 5091 | 308.617 |
| 5092 | 307.617 |
| 5093 | 306.617 |
| 5094 | 305.617 |
| 5095 | 304.617 |
| 5096 | 303.617 |
| 5097 | 302.617 |
| 5098 | 301.617 |
| 5099 | 300.617 |
| 5100 | 299.617 |
| 5101 | 298.617 |
| 5102 | 297.617 |
| 5103 | 300.557 |
| 5104 | 299.557 |
| 5105 | 298.557 |
| 5106 | 297.557 |
| 5107 | 302.007 |
| 5108 | 301.007 |
| 5109 | 300.007 |
| 5110 | 299.007 |
| 5111 | 298.007 |
| 5112 | 297.007 |
| 5113 | 296.007 |
| 5114 | 295.007 |
| 5115 | 294.007 |
| 5116 | 293.007 |
| 5117 | 292.007 |
| 5118 | 291.007 |
| 5119 | 290.007 |
| 5120 | 289.007 |
| 5121 | 288.007 |
| 5122 | 287.007 |
| 5123 | 286.007 |
| 5124 | 289.397 |
| 5125 | 288.397 |
| 5126 | 287.397 |
| 5127 | 286.397 |
| 5128 | 285.397 |
| 5129 | 288.867 |
| 5130 | 292.197 |
| 5131 | 291.197 |
| 5132 | 290.197 |
| 5133 | 289.197 |
| 5134 | 288.197 |
| 5135 | 287.197 |
| 5136 | 290.357 |
| 5137 | 289.357 |
| 5138 | 288.357 |
| 5139 | 287.357 |
| 5140 | 286.357 |
| 5141 | 290.397 |
| 5142 | 289.397 |
| 5143 | 288.397 |
| 5144 | 287.397 |
| 5145 | 290.297 |
| 5146 | 289.297 |
| 5147 | 288.297 |
| 5148 | 287.297 |
| 5149 | 292.347 |
| 5150 | 291.347 |
| 5151 | 290.347 |
| 5152 | 289.347 |
| 5153 | 288.347 |
| 5154 | 287.347 |
| 5155 | 291.367 |
| 5156 | 290.367 |
| 5157 | 292.687 |
| 5158 | 291.687 |
| 5159 | 290.687 |
| 5160 | 289.687 |
| 5161 | 288.687 |
| 5162 | 287.687 |
| 5163 | 286.687 |
| 5164 | 285.687 |
| 5165 | 284.687 |
| 5166 | 287.917 |
| 5167 | 286.917 |
| 5168 | 289.857 |
| 5169 | 288.857 |
| 5170 | 287.857 |
| 5171 | 290.597 |
| 5172 | 289.597 |
| 5173 | 292.297 |
| 5174 | 291.297 |
| 5175 | 290.297 |
| 5176 | 289.297 |
| 5177 | 288.297 |
| 5178 | 287.297 |
| 5179 | 286.297 |
| 5180 | 285.297 |
| 5181 | 284.297 |
| 5182 | 283.297 |
| 5183 | 282.297 |
| 5184 | 285.827 |
| 5185 | 284.827 |
| 5186 | 288.647 |
| 5187 | 287.647 |
| 5188 | 286.647 |
| 5189 | 285.647 |
| 5190 | 284.647 |
| 5191 | 283.647 |
| 5192 | 282.647 |
| 5193 | 281.647 |
| 5194 | 280.647 |
| 5195 | 283.877 |
| 5196 | 282.877 |
| 5197 | 281.877 |
| 5198 | 285.797 |
| 5199 | 288.687 |
| 5200 | 287.687 |
| 5201 | 286.687 |
| 5202 | 285.687 |
| 5203 | 284.687 |
| 5204 | 287.287 |
| 5205 | 286.287 |
| 5206 | 285.287 |
| 5207 | 284.287 |
| 5208 | 283.287 |
| 5209 | 282.287 |
| 5210 | 284.917 |
| 5211 | 288.057 |
| 5212 | 287.057 |
| 5213 | 286.057 |
| 5214 | 285.057 |
| 5215 | 284.057 |
| 5216 | 283.057 |
| 5217 | 282.057 |
| 5218 | 281.057 |
| 5219 | 280.057 |
| 5220 | 279.057 |
| 5221 | 278.057 |
| 5222 | 277.057 |
| 5223 | 280.577 |
| 5224 | 279.577 |
| 5225 | 278.577 |
| 5226 | 277.577 |
| 5227 | 276.577 |
| 5228 | 275.577 |
| 5229 | 274.577 |
| 5230 | 273.577 |
| 5231 | 272.577 |
| 5232 | 271.577 |
| 5233 | 274.437 |
| 5234 | 273.437 |
| 5235 | 272.437 |
| 5236 | 271.437 |
| 5237 | 273.987 |
| 5238 | 272.987 |
| 5239 | 271.987 |
| 5240 | 270.987 |
| 5241 | 269.987 |
| 5242 | 268.987 |
| 5243 | 267.987 |
| 5244 | 266.987 |
| 5245 | 265.987 |
| 5246 | 264.987 |
| 5247 | 263.987 |
| 5248 | 262.987 |
| 5249 | 261.987 |
| 5250 | 267.867 |
| 5251 | 266.867 |
| 5252 | 265.867 |
| 5253 | 264.867 |
| 5254 | 263.867 |
| 5255 | 262.867 |
| 5256 | 266.667 |
| 5257 | 265.667 |
| 5258 | 264.667 |
| 5259 | 263.667 |
| 5260 | 266.847 |
| 5261 | 265.847 |
| 5262 | 264.847 |
| 5263 | 263.847 |
| 5264 | 262.847 |
| 5265 | 261.847 |
| 5266 | 260.847 |
| 5267 | 259.847 |
| 5268 | 258.847 |
| 5269 | 257.847 |
| 5270 | 256.847 |
| 5271 | 255.847 |
| 5272 | 259.377 |
| 5273 | 258.377 |
| 5274 | 257.377 |
| 5275 | 256.377 |
| 5276 | 255.377 |
| 5277 | 254.377 |
| 5278 | 253.377 |
| 5279 | 252.377 |
| 5280 | 251.377 |
| 5281 | 250.377 |
| 5282 | 249.377 |
| 5283 | 248.377 |
| 5284 | 252.387 |
| 5285 | 251.387 |
| 5286 | 250.387 |
| 5287 | 249.387 |
| 5288 | 248.387 |
| 5289 | 250.917 |
| 5290 | 254.837 |
| 5291 | 253.837 |
| 5292 | 252.837 |
| 5293 | 251.837 |
| 5294 | 255.037 |
| 5295 | 254.037 |
| 5296 | 253.037 |
| 5297 | 252.037 |
| 5298 | 251.037 |
| 5299 | 250.037 |
| 5300 | 249.037 |
| 5301 | 248.037 |
| 5302 | 251.157 |
| 5303 | 254.877 |
| 5304 | 253.877 |
| 5305 | 252.877 |
| 5306 | 256.597 |
| 5307 | 255.597 |
| 5308 | 254.597 |
| 5309 | 253.597 |
| 5310 | 252.597 |
| 5311 | 255.537 |
| 5312 | 258.257 |
| 5313 | 257.257 |
| 5314 | 256.257 |
| 5315 | 255.257 |
| 5316 | 254.257 |
| 5317 | 253.257 |
| 5318 | 252.257 |
| 5319 | 251.257 |
| 5320 | 250.257 |
| 5321 | 249.257 |
| 5322 | 252.047 |
| 5323 | 251.047 |
| 5324 | 250.047 |
| 5325 | 252.697 |
| 5326 | 251.697 |
| 5327 | 250.697 |
| 5328 | 249.697 |
| 5329 | 248.697 |
| 5330 | 247.697 |
| 5331 | 246.697 |
| 5332 | 245.697 |
| 5333 | 248.987 |
| 5334 | 251.927 |
| 5335 | 250.927 |
| 5336 | 249.927 |
| 5337 | 248.927 |
| 5338 | 247.927 |
| 5339 | 246.927 |
| 5340 | 249.447 |
| 5341 | 248.447 |
| 5342 | 247.447 |
| 5343 | 246.447 |
| 5344 | 245.447 |
| 5345 | 244.447 |
| 5346 | 243.447 |
| 5347 | 247.367 |
| 5348 | 246.367 |
| 5349 | 245.367 |
| 5350 | 248.017 |
| 5351 | 251.957 |
| 5352 | 254.407 |
| 5353 | 253.407 |
| 5354 | 252.407 |
| 5355 | 251.407 |
| 5356 | 250.407 |
| 5357 | 249.407 |
| 5358 | 248.407 |
| 5359 | 247.407 |
| 5360 | 246.407 |
| 5361 | 245.407 |
| 5362 | 244.407 |
| 5363 | 243.407 |
| 5364 | 242.407 |
| 5365 | 245.057 |
| 5366 | 244.057 |
| 5367 | 243.057 |
| 5368 | 242.057 |
| 5369 | 246.217 |
| 5370 | 245.217 |
| 5371 | 248.447 |
| 5372 | 247.447 |
| 5373 | 246.447 |
| 5374 | 245.447 |
| 5375 | 244.447 |
| 5376 | 243.447 |
| 5377 | 242.447 |
| 5378 | 244.827 |
| 5379 | 243.827 |
| 5380 | 242.827 |
| 5381 | 241.827 |
| 5382 | 240.827 |
| 5383 | 239.827 |
| 5384 | 244.037 |
| 5385 | 247.087 |
| 5386 | 246.087 |
| 5387 | 245.087 |
| 5388 | 247.627 |
| 5389 | 246.627 |
| 5390 | 245.627 |
| 5391 | 248.387 |
| 5392 | 247.387 |
| 5393 | 246.387 |
| 5394 | 245.387 |
| 5395 | 244.387 |
| 5396 | 243.387 |
| 5397 | 242.387 |
| 5398 | 241.387 |
| 5399 | 240.387 |
| 5400 | 239.387 |
| 5401 | 238.387 |
| 5402 | 241.307 |
| 5403 | 240.307 |
| 5404 | 239.307 |
| 5405 | 241.457 |
| 5406 | 240.457 |
| 5407 | 239.457 |
| 5408 | 242.127 |
| 5409 | 241.127 |
| 5410 | 240.127 |
| 5411 | 239.127 |
| 5412 | 238.127 |
| 5413 | 237.127 |
| 5414 | 236.127 |
| 5415 | 235.127 |
| 5416 | 234.127 |
| 5417 | 233.127 |
| 5418 | 232.127 |
| 5419 | 231.127 |
| 5420 | 234.267 |
| 5421 | 233.267 |
| 5422 | 237.287 |
| 5423 | 236.287 |
| 5424 | 235.287 |
| 5425 | 234.287 |
| 5426 | 238.867 |
| 5427 | 237.867 |
| 5428 | 236.867 |
| 5429 | 239.907 |
| 5430 | 238.907 |
| 5431 | 237.907 |
| 5432 | 236.907 |
| 5433 | 239.597 |
| 5434 | 242.357 |
| 5435 | 241.357 |
| 5436 | 244.197 |
| 5437 | 243.197 |
| 5438 | 246.727 |
| 5439 | 249.277 |
| 5440 | 248.277 |
| 5441 | 247.277 |
| 5442 | 249.657 |
| 5443 | 252.407 |
| 5444 | 251.407 |
| 5445 | 250.407 |
| 5446 | 249.407 |
| 5447 | 248.407 |
| 5448 | 251.267 |
| 5449 | 254.677 |
| 5450 | 253.677 |
| 5451 | 252.677 |
| 5452 | 251.677 |
| 5453 | 250.677 |
| 5454 | 249.677 |
| 5455 | 248.677 |
| 5456 | 247.677 |
| 5457 | 250.997 |
| 5458 | 249.997 |
| 5459 | 248.997 |
| 5460 | 247.997 |
| 5461 | 251.427 |
| 5462 | 250.427 |
| 5463 | 249.427 |
| 5464 | 248.427 |
| 5465 | 251.407 |
| 5466 | 250.407 |
| 5467 | 249.407 |
| 5468 | 248.407 |
| 5469 | 247.407 |
| 5470 | 246.407 |
| 5471 | 245.407 |
| 5472 | 244.407 |
| 5473 | 248.077 |
| 5474 | 247.077 |
| 5475 | 246.077 |
| 5476 | 249.117 |
| 5477 | 248.117 |
| 5478 | 247.117 |
| 5479 | 246.117 |
| 5480 | 245.117 |
| 5481 | 244.117 |
| 5482 | 243.117 |
| 5483 | 242.117 |
| 5484 | 241.117 |
| 5485 | 240.117 |
| 5486 | 243.767 |
| 5487 | 242.767 |
| 5488 | 241.767 |
| 5489 | 240.767 |
| 5490 | 243.737 |
| 5491 | 242.737 |
| 5492 | 245.867 |
| 5493 | 244.867 |
| 5494 | 243.867 |
| 5495 | 246.347 |
| 5496 | 245.347 |
| 5497 | 244.347 |
| 5498 | 243.347 |
| 5499 | 242.347 |
| 5500 | 241.347 |
| 5501 | 240.347 |
| 5502 | 239.347 |
| 5503 | 238.347 |
| 5504 | 237.347 |
| 5505 | 236.347 |
| 5506 | 235.347 |
| 5507 | 238.597 |
| 5508 | 242.517 |
| 5509 | 245.557 |
| 5510 | 244.557 |
| 5511 | 243.557 |
| 5512 | 242.557 |
| 5513 | 241.557 |
| 5514 | 240.557 |
| 5515 | 239.557 |
| 5516 | 238.557 |
| 5517 | 237.557 |
| 5518 | 236.557 |
| 5519 | 235.557 |
| 5520 | 234.557 |
| 5521 | 233.557 |
| 5522 | 232.557 |
| 5523 | 231.557 |
| 5524 | 230.557 |
| 5525 | 229.557 |
| 5526 | 228.557 |
| 5527 | 227.557 |
| 5528 | 226.557 |
| 5529 | 225.557 |
| 5530 | 231.047 |
| 5531 | 230.047 |
| 5532 | 229.047 |
| 5533 | 228.047 |
| 5534 | 227.047 |
| 5535 | 226.047 |
| 5536 | 225.047 |
| 5537 | 224.047 |
| 5538 | 223.047 |
| 5539 | 222.047 |
| 5540 | 225.337 |
| 5541 | 224.337 |
| 5542 | 223.337 |
| 5543 | 222.337 |
| 5544 | 225.967 |
| 5545 | 224.967 |
| 5546 | 223.967 |
| 5547 | 222.967 |
| 5548 | 226.297 |
| 5549 | 225.297 |
| 5550 | 224.297 |
| 5551 | 223.297 |
| 5552 | 222.297 |
| 5553 | 221.297 |
| 5554 | 220.297 |
| 5555 | 219.297 |
| 5556 | 218.297 |
| 5557 | 217.297 |
| 5558 | 216.297 |
| 5559 | 215.297 |
| 5560 | 214.297 |
| 5561 | 217.507 |
| 5562 | 216.507 |
| 5563 | 215.507 |
| 5564 | 214.507 |
| 5565 | 213.507 |
| 5566 | 212.507 |
| 5567 | 211.507 |
| 5568 | 210.507 |
| 5569 | 214.367 |
| 5570 | 218.387 |
| 5571 | 217.387 |
| 5572 | 221.407 |
| 5573 | 220.407 |
| 5574 | 224.837 |
| 5575 | 223.837 |
| 5576 | 227.607 |
| 5577 | 226.577 |
| 5578 | 225.577 |
| 5579 | 224.577 |
| 5580 | 223.577 |
| 5581 | 222.577 |
| 5582 | 226.067 |
| 5583 | 225.067 |
| 5584 | 224.067 |
| 5585 | 223.067 |
| 5586 | 222.067 |
| 5587 | 221.067 |
| 5588 | 220.067 |
| 5589 | 219.067 |
| 5590 | 218.067 |
| 5591 | 217.067 |
| 5592 | 216.067 |
| 5593 | 215.067 |
| 5594 | 214.067 |
| 5595 | 213.067 |
| 5596 | 217.847 |
| 5597 | 216.827 |
| 5598 | 215.807 |
| 5599 | 214.807 |
| 5600 | 213.807 |
| 5601 | 222.757 |
| 5602 | 221.677 |
| 5603 | 220.677 |
| 5604 | 219.677 |
| 5605 | 218.677 |
| 5606 | 217.677 |
| 5607 | 216.677 |
| 5608 | 215.677 |
| 5609 | 214.677 |
| 5610 | 213.677 |
| 5611 | 212.677 |
| 5612 | 211.677 |
| 5613 | 210.677 |
| 5614 | 209.677 |
| 5615 | 208.677 |
| 5616 | 207.677 |
| 5617 | 206.677 |
| 5618 | 205.677 |
| 5619 | 204.677 |
| 5620 | 203.677 |
| 5621 | 202.677 |
| 5622 | 201.677 |
| 5623 | 208.892 |
| 5624 | 207.827 |
| 5625 | 212.787 |
| 5626 | 211.747 |
| 5627 | 210.747 |
| 5628 | 209.747 |
| 5629 | 208.747 |
| 5630 | 207.747 |
| 5631 | 206.747 |
| 5632 | 205.747 |
| 5633 | 210.697 |
| 5634 | 209.657 |
| 5635 | 208.657 |
| 5636 | 207.657 |
| 5637 | 206.657 |
| 5638 | 205.657 |
| 5639 | 204.657 |
| 5640 | 213.387 |
| 5641 | 212.307 |
| 5642 | 211.307 |
| 5643 | 210.307 |
| 5644 | 214.572 |
| 5645 | 213.537 |
| 5646 | 212.537 |
| 5647 | 211.537 |
| 5648 | 210.467 |
| 5649 | 209.397 |
| 5650 | 221.827 |
| 5651 | 220.827 |
| 5652 | 219.827 |
| 5653 | 218.827 |
| 5654 | 217.827 |
| 5655 | 216.762 |
| 5656 | 224.087 |
| 5657 | 223.087 |
| 5658 | 222.087 |
| 5659 | 221.087 |
| 5660 | 220.087 |
| 5661 | 219.087 |
| 5662 | 218.087 |
| 5663 | 217.087 |
| 5664 | 216.001 |
| 5665 | 214.915 |
| 5666 | 213.829 |
| 5667 | 239.063 |
| 5668 | 237.977 |
| 5669 | 236.944 |
| 5670 | 246.362 |
| 5671 | 245.329 |
| 5672 | 244.297 |
| 5673 | 253.722 |
| 5674 | 252.637 |
| 5675 | 251.637 |
| 5676 | 250.637 |
| 5677 | 249.637 |
| 5678 | 248.637 |
| 5679 | 247.637 |
| 5680 | 246.637 |
| 5681 | 245.637 |
| 5682 | 244.637 |
| 5683 | 243.637 |
| 5684 | 242.637 |
| 5685 | 241.637 |
| 5686 | 240.637 |
| 5687 | 239.637 |
| 5688 | 243.367 |
| 5689 | 242.357 |
| 5690 | 241.347 |
| 5691 | 240.347 |
| 5692 | 239.347 |
| 5693 | 238.347 |
| 5694 | 237.347 |
| 5695 | 236.347 |
| 5696 | 235.347 |
| 5697 | 234.347 |
| 5698 | 233.347 |
| 5699 | 232.347 |
| 5700 | 231.347 |
| 5701 | 230.293 |
| 5702 | 229.24 |
| 5703 | 239.157 |
| 5704 | 238.007 |
| 5705 | 253.857 |
| 5706 | 252.857 |
| 5707 | 251.857 |
| 5708 | 250.857 |
| 5709 | 249.857 |
| 5710 | 248.857 |
| 5711 | 247.857 |
| 5712 | 246.857 |
| 5713 | 245.857 |
| 5714 | 244.857 |
| 5715 | 252.877 |
| 5716 | 251.807 |
| 5717 | 250.807 |
| 5718 | 249.807 |
| 5719 | 248.807 |
| 5720 | 247.807 |
| 5721 | 246.807 |
| 5722 | 245.807 |
| 5723 | 244.807 |
| 5724 | 243.807 |
| 5725 | 242.807 |
| 5726 | 246.017 |
| 5727 | 244.997 |
| 5728 | 243.997 |
| 5729 | 242.997 |
| 5730 | 241.997 |
| 5731 | 240.997 |
| 5732 | 239.997 |
| 5733 | 238.997 |
| 5734 | 237.997 |
| 5735 | 236.997 |
| 5736 | 235.997 |
| 5737 | 234.997 |
| 5738 | 233.997 |
| 5739 | 242.563 |
| 5740 | 241.52 |
| 5741 | 240.477 |
| 5742 | 239.477 |
| 5743 | 238.477 |
| 5744 | 237.477 |
| 5745 | 240.887 |
| 5746 | 239.877 |
| 5747 | 238.867 |
| 5748 | 237.867 |
| 5749 | 236.867 |
| 5750 | 235.867 |
| 5751 | 234.867 |
| 5752 | 233.867 |
| 5753 | 232.867 |
| 5754 | 231.867 |
| 5755 | 230.867 |
| 5756 | 229.867 |
| 5757 | 228.867 |
| 5758 | 227.867 |
| 5759 | 226.867 |
| 5760 | 225.867 |
| 5761 | 224.867 |
| 5762 | 223.867 |
| 5763 | 222.867 |
| 5764 | 221.867 |
| 5765 | 220.867 |
| 5766 | 219.767 |
| 5767 | 230.857 |
| 5768 | 229.812 |
| 5769 | 235.167 |
| 5770 | 234.167 |
| 5771 | 233.167 |
| 5772 | 231.843 |
| 5773 | 230.52 |
| 5774 | 280.717 |
| 5775 | 279.717 |
| 5776 | 278.717 |
| 5777 | 277.717 |
| 5778 | 276.717 |
| 5779 | 275.717 |
| 5780 | 274.717 |
| 5781 | 273.717 |
| 5782 | 272.717 |
| 5783 | 271.717 |
| 5784 | 270.717 |
| 5785 | 269.717 |
| 5786 | 268.717 |
| 5787 | 267.717 |
| 5788 | 266.717 |
| 5789 | 265.717 |
| 5790 | 264.717 |
| 5791 | 263.717 |
| 5792 | 262.717 |
| 5793 | 261.717 |
| 5794 | 260.717 |
| 5795 | 259.717 |
| 5796 | 258.717 |
| 5797 | 257.717 |
| 5798 | 256.717 |
| 5799 | 255.717 |
| 5800 | 254.717 |
| 5801 | 253.717 |
| 5802 | 252.717 |
| 5803 | 251.717 |
| 5804 | 250.717 |
| 5805 | 249.717 |
| 5806 | 248.717 |
| 5807 | 247.717 |
| 5808 | 246.717 |
| 5809 | 245.717 |
| 5810 | 244.717 |
| 5811 | 243.717 |
| 5812 | 242.717 |
| 5813 | 241.717 |
| 5814 | 240.717 |
| 5815 | 239.717 |
| 5816 | 238.717 |
| 5817 | 237.717 |
| 5818 | 236.717 |
| 5819 | 235.717 |
| 5820 | 234.717 |
| 5821 | 233.717 |
| 5822 | 232.717 |
| 5823 | 231.717 |
| 5824 | 230.717 |
| 5825 | 229.717 |
| 5826 | 228.717 |
| 5827 | 227.717 |
| 5828 | 226.717 |
| 5829 | 225.717 |
| 5830 | 224.717 |
| 5831 | 223.717 |
| 5832 | 222.717 |
| 5833 | 221.717 |
| 5834 | 220.717 |
| 5835 | 219.717 |
| 5836 | 218.717 |
| 5837 | 217.717 |
| 5838 | 223.154 |
| 5839 | 222.142 |
| 5840 | 221.129 |
| 5841 | 220.117 |
| 5842 | 219.117 |
| 5843 | 218.117 |
| 5844 | 217.117 |
| 5845 | 216.117 |
| 5846 | 215.117 |
| 5847 | 214.117 |
| 5848 | 213.117 |
| 5849 | 212.117 |
| 5850 | 211.117 |
| 5851 | 210.117 |
| 5852 | 209.117 |
| 5853 | 208.117 |
| 5854 | 207.117 |
| 5855 | 206.117 |
| 5856 | 205.117 |
| 5857 | 204.117 |
| 5858 | 203.117 |
| 5859 | 202.117 |
| 5860 | 201.117 |
| 5861 | 200.117 |
| 5862 | 203.897 |
| 5863 | 202.867 |
| 5864 | 201.867 |
| 5865 | 200.867 |
| 5866 | 206.392 |
| 5867 | 205.347 |
| 5868 | 215.752 |
| 5869 | 214.657 |
| 5870 | 213.657 |
| 5871 | 212.657 |
| 5872 | 211.657 |
| 5873 | 210.657 |
| 5874 | 209.657 |
| 5875 | 208.657 |
| 5876 | 207.657 |
| 5877 | 206.657 |
| 5878 | 205.657 |
| 5879 | 204.657 |
| 5880 | 203.657 |
| 5881 | 202.657 |
| 5882 | 201.657 |
| 5883 | 200.657 |
| 5884 | 199.657 |
| 5885 | 198.657 |
| 5886 | 197.657 |
| 5887 | 196.657 |
| 5888 | 195.657 |
| 5889 | 194.657 |
| 5890 | 210.962 |
| 5891 | 209.807 |
| 5892 | 208.807 |
| 5893 | 207.807 |
| 5894 | 217.717 |
| 5895 | 216.627 |
| 5896 | 215.627 |
| 5897 | 214.627 |
| 5898 | 213.627 |
| 5899 | 212.56 |
| 5900 | 224.463 |
| 5901 | 223.397 |
| 5902 | 222.397 |
| 5903 | 221.397 |
| 5904 | 220.397 |
| 5905 | 219.397 |
| 5906 | 218.397 |
| 5907 | 217.397 |
| 5908 | 216.397 |
| 5909 | 215.397 |
| 5910 | 214.397 |
| 5911 | 213.397 |
| 5912 | 212.397 |
| 5913 | 211.397 |
| 5914 | 210.397 |
| 5915 | 209.397 |
| 5916 | 208.397 |
| 5917 | 207.397 |
| 5918 | 206.397 |
| 5919 | 205.397 |
| 5920 | 204.397 |
| 5921 | 203.397 |
| 5922 | 202.35 |
| 5923 | 211.493 |
| 5924 | 210.447 |
| 5925 | 209.382 |
| 5926 | 208.317 |
| 5927 | 224.152 |
| 5928 | 223.087 |
| 5929 | 222.087 |
| 5930 | 221.087 |
| 5931 | 230.837 |
| 5932 | 229.747 |
| 5933 | 228.747 |
| 5934 | 227.747 |
| 5935 | 226.747 |
| 5936 | 231.139 |
| 5937 | 230.132 |
| 5938 | 229.124 |
| 5939 | 228.117 |
| 5940 | 227.117 |
| 5941 | 226.117 |
| 5942 | 225.117 |
| 5943 | 224.117 |
| 5944 | 223.117 |
| 5945 | 222.117 |
| 5946 | 221.117 |
| 5947 | 220.117 |
| 5948 | 219.117 |
| 5949 | 218.117 |
| 5950 | 217.069 |
| 5951 | 216.021 |
| 5952 | 214.973 |
| 5953 | 230.925 |
| 5954 | 229.877 |
| 5955 | 228.877 |
| 5956 | 227.877 |
| 5957 | 226.877 |
| 5958 | 225.877 |
| 5959 | 224.877 |
| 5960 | 223.877 |
| 5961 | 222.877 |
| 5962 | 221.877 |
| 5963 | 220.877 |
| 5964 | 219.877 |
| 5965 | 218.877 |
| 5966 | 217.877 |
| 5967 | 216.877 |
| 5968 | 215.877 |
| 5969 | 214.877 |
| 5970 | 213.877 |
| 5971 | 212.877 |
| 5972 | 211.877 |
| 5973 | 210.877 |
| 5974 | 209.877 |
| 5975 | 208.877 |
| 5976 | 207.877 |
| 5977 | 206.877 |
| 5978 | 212.017 |
| 5979 | 211.017 |
| 5980 | 215.657 |
| 5981 | 214.657 |
| 5982 | 213.657 |
| 5983 | 219.537 |
| 5984 | 218.537 |
| 5985 | 224.917 |
| 5986 | 223.917 |
| 5987 | 222.917 |
| 5988 | 221.917 |
| 5989 | 220.917 |
| 5990 | 219.917 |
| 5991 | 218.917 |
| 5992 | 217.917 |
| 5993 | 216.917 |
| 5994 | 215.917 |
| 5995 | 214.917 |
| 5996 | 213.917 |
| 5997 | 220.557 |
| 5998 | 225.847 |
| 5999 | 224.847 |
| 6000 | 223.847 |
| 6001 | 228.817 |
| 6002 | 227.816 |
| 6003 | 226.816 |
| 6004 | 225.816 |
| 6005 | 224.816 |
| 6006 | 223.816 |
| 6007 | 222.816 |
| 6008 | 221.816 |
| 6009 | 220.816 |
| 6010 | 219.816 |
| 6011 | 218.816 |
| 6012 | 217.816 |
| 6013 | 216.816 |
| 6014 | 215.816 |
| 6015 | 214.816 |
| 6016 | 221.326 |
| 6017 | 220.326 |
| 6018 | 219.326 |
| 6019 | 218.326 |
| 6020 | 217.326 |
| 6021 | 216.326 |
| 6022 | 221.166 |
| 6023 | 228.096 |
| 6024 | 227.096 |
| 6025 | 226.096 |
| 6026 | 231.876 |
| 6027 | 230.876 |
| 6028 | 229.876 |
| 6029 | 228.876 |
| 6030 | 227.876 |
| 6031 | 226.876 |
| 6032 | 225.876 |
| 6033 | 231.366 |
| 6034 | 230.366 |
| 6035 | 229.366 |
| 6036 | 228.366 |
| 6037 | 233.366 |
| 6038 | 232.366 |
| 6039 | 231.366 |
| 6040 | 230.366 |
| 6041 | 229.366 |
| 6042 | 228.366 |
| 6043 | 227.366 |
| 6044 | 226.366 |
| 6045 | 225.366 |
| 6046 | 231.276 |
| 6047 | 230.276 |
| 6048 | 229.276 |
| 6049 | 228.276 |
| 6050 | 227.277 |
| 6051 | 226.277 |
| 6052 | 234.327 |
| 6053 | 233.327 |
| 6054 | 232.327 |
| 6055 | 231.327 |
| 6056 | 230.327 |
| 6057 | 236.987 |
| 6058 | 235.987 |
| 6059 | 234.987 |
| 6060 | 233.987 |
| 6061 | 232.987 |
| 6062 | 231.987 |
| 6063 | 230.987 |
| 6064 | 229.987 |
| 6065 | 228.987 |
| 6066 | 227.987 |
| 6067 | 226.987 |
| 6068 | 225.987 |
| 6069 | 231.277 |
| 6070 | 230.277 |
| 6071 | 229.277 |
| 6072 | 228.277 |
| 6073 | 227.277 |
| 6074 | 226.277 |
| 6075 | 233.007 |
| 6076 | 232.007 |
| 6077 | 231.007 |
| 6078 | 230.007 |
| 6079 | 229.007 |
| 6080 | 228.007 |
| 6081 | 233.787 |
| 6082 | 232.787 |
| 6083 | 231.787 |
| 6084 | 230.787 |
| 6085 | 229.787 |
| 6086 | 228.787 |
| 6087 | 227.787 |
| 6088 | 226.787 |
| 6089 | 225.787 |
| 6090 | 224.787 |
| 6091 | 223.787 |
| 6092 | 229.667 |
| 6093 | 228.667 |
| 6094 | 234.387 |
| 6095 | 233.387 |
| 6096 | 232.387 |
| 6097 | 239.797 |
| 6098 | 238.797 |
| 6099 | 237.797 |
| 6100 | 236.797 |
| 6101 | 235.797 |
| 6102 | 234.797 |
| 6103 | 241.227 |
| 6104 | 240.227 |
| 6105 | 239.227 |
| 6106 | 238.227 |
| 6107 | 243.067 |
| 6108 | 242.067 |
| 6109 | 241.067 |
| 6110 | 240.067 |
| 6111 | 239.067 |
| 6112 | 238.067 |
| 6113 | 237.067 |
| 6114 | 245.687 |
| 6115 | 244.687 |
| 6116 | 243.687 |
| 6117 | 249.567 |
| 6118 | 248.567 |
| 6119 | 247.567 |
| 6120 | 246.567 |
| 6121 | 245.567 |
| 6122 | 244.567 |
| 6123 | 243.527 |
| 6124 | 242.527 |
| 6125 | 241.527 |
| 6126 | 240.527 |
| 6127 | 239.527 |
| 6128 | 238.527 |
| 6129 | 237.527 |
| 6130 | 236.527 |
| 6131 | 235.527 |
| 6132 | 234.527 |
| 6133 | 233.527 |
| 6134 | 232.527 |
| 6135 | 231.527 |
| 6136 | 230.527 |
| 6137 | 229.527 |
| 6138 | 228.527 |